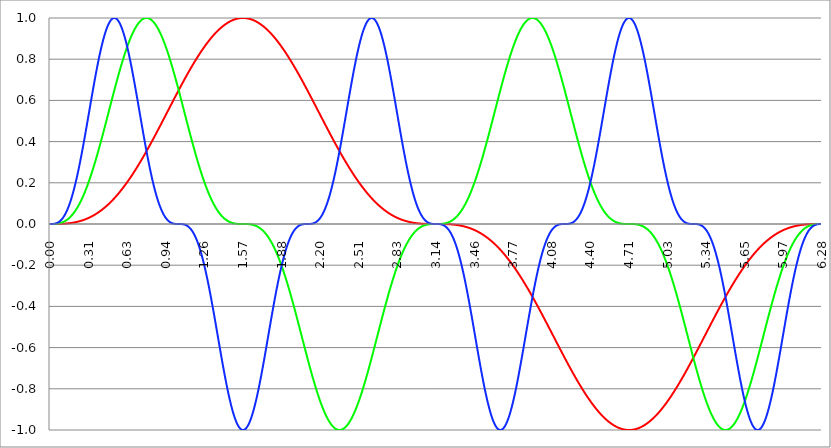
| Category | Series 1 | Series 0 | Series 2 |
|---|---|---|---|
| 0.0 | 0 | 0 | 0 |
| 0.00314159265358979 | 0 | 0 | 0 |
| 0.00628318530717958 | 0 | 0 | 0 |
| 0.00942477796076938 | 0 | 0 | 0 |
| 0.0125663706143592 | 0 | 0 | 0 |
| 0.015707963267949 | 0 | 0 | 0 |
| 0.0188495559215388 | 0 | 0 | 0 |
| 0.0219911485751285 | 0 | 0 | 0 |
| 0.0251327412287183 | 0 | 0 | 0 |
| 0.0282743338823081 | 0 | 0 | 0.001 |
| 0.0314159265358979 | 0 | 0 | 0.001 |
| 0.0345575191894877 | 0 | 0 | 0.001 |
| 0.0376991118430775 | 0 | 0 | 0.001 |
| 0.0408407044966673 | 0 | 0.001 | 0.002 |
| 0.0439822971502571 | 0 | 0.001 | 0.002 |
| 0.0471238898038469 | 0 | 0.001 | 0.003 |
| 0.0502654824574367 | 0 | 0.001 | 0.003 |
| 0.0534070751110265 | 0 | 0.001 | 0.004 |
| 0.0565486677646163 | 0 | 0.001 | 0.005 |
| 0.059690260418206 | 0 | 0.002 | 0.006 |
| 0.0628318530717958 | 0 | 0.002 | 0.007 |
| 0.0659734457253856 | 0 | 0.002 | 0.008 |
| 0.0691150383789754 | 0 | 0.003 | 0.009 |
| 0.0722566310325652 | 0 | 0.003 | 0.01 |
| 0.075398223686155 | 0 | 0.003 | 0.011 |
| 0.0785398163397448 | 0 | 0.004 | 0.013 |
| 0.0816814089933346 | 0.001 | 0.004 | 0.014 |
| 0.0848230016469244 | 0.001 | 0.005 | 0.016 |
| 0.0879645943005142 | 0.001 | 0.005 | 0.018 |
| 0.091106186954104 | 0.001 | 0.006 | 0.02 |
| 0.0942477796076937 | 0.001 | 0.007 | 0.022 |
| 0.0973893722612835 | 0.001 | 0.007 | 0.024 |
| 0.100530964914873 | 0.001 | 0.008 | 0.026 |
| 0.103672557568463 | 0.001 | 0.009 | 0.029 |
| 0.106814150222053 | 0.001 | 0.01 | 0.031 |
| 0.109955742875643 | 0.001 | 0.01 | 0.034 |
| 0.113097335529233 | 0.001 | 0.011 | 0.037 |
| 0.116238928182822 | 0.002 | 0.012 | 0.04 |
| 0.119380520836412 | 0.002 | 0.013 | 0.043 |
| 0.122522113490002 | 0.002 | 0.014 | 0.046 |
| 0.125663706143592 | 0.002 | 0.015 | 0.05 |
| 0.128805298797181 | 0.002 | 0.017 | 0.054 |
| 0.131946891450771 | 0.002 | 0.018 | 0.057 |
| 0.135088484104361 | 0.002 | 0.019 | 0.061 |
| 0.138230076757951 | 0.003 | 0.02 | 0.065 |
| 0.141371669411541 | 0.003 | 0.022 | 0.07 |
| 0.14451326206513 | 0.003 | 0.023 | 0.074 |
| 0.14765485471872 | 0.003 | 0.025 | 0.079 |
| 0.15079644737231 | 0.003 | 0.026 | 0.084 |
| 0.1539380400259 | 0.004 | 0.028 | 0.088 |
| 0.15707963267949 | 0.004 | 0.03 | 0.094 |
| 0.160221225333079 | 0.004 | 0.031 | 0.099 |
| 0.163362817986669 | 0.004 | 0.033 | 0.104 |
| 0.166504410640259 | 0.005 | 0.035 | 0.11 |
| 0.169646003293849 | 0.005 | 0.037 | 0.116 |
| 0.172787595947439 | 0.005 | 0.039 | 0.122 |
| 0.175929188601028 | 0.005 | 0.041 | 0.128 |
| 0.179070781254618 | 0.006 | 0.043 | 0.134 |
| 0.182212373908208 | 0.006 | 0.045 | 0.14 |
| 0.185353966561798 | 0.006 | 0.048 | 0.147 |
| 0.188495559215388 | 0.007 | 0.05 | 0.154 |
| 0.191637151868977 | 0.007 | 0.052 | 0.161 |
| 0.194778744522567 | 0.007 | 0.055 | 0.168 |
| 0.197920337176157 | 0.008 | 0.057 | 0.175 |
| 0.201061929829747 | 0.008 | 0.06 | 0.183 |
| 0.204203522483336 | 0.008 | 0.063 | 0.19 |
| 0.207345115136926 | 0.009 | 0.065 | 0.198 |
| 0.210486707790516 | 0.009 | 0.068 | 0.206 |
| 0.213628300444106 | 0.01 | 0.071 | 0.214 |
| 0.216769893097696 | 0.01 | 0.074 | 0.222 |
| 0.219911485751285 | 0.01 | 0.077 | 0.23 |
| 0.223053078404875 | 0.011 | 0.08 | 0.239 |
| 0.226194671058465 | 0.011 | 0.084 | 0.247 |
| 0.229336263712055 | 0.012 | 0.087 | 0.256 |
| 0.232477856365645 | 0.012 | 0.09 | 0.265 |
| 0.235619449019234 | 0.013 | 0.094 | 0.274 |
| 0.238761041672824 | 0.013 | 0.097 | 0.283 |
| 0.241902634326414 | 0.014 | 0.101 | 0.292 |
| 0.245044226980004 | 0.014 | 0.104 | 0.302 |
| 0.248185819633594 | 0.015 | 0.108 | 0.311 |
| 0.251327412287183 | 0.015 | 0.112 | 0.321 |
| 0.254469004940773 | 0.016 | 0.116 | 0.33 |
| 0.257610597594363 | 0.017 | 0.12 | 0.34 |
| 0.260752190247953 | 0.017 | 0.124 | 0.35 |
| 0.263893782901543 | 0.018 | 0.128 | 0.36 |
| 0.267035375555132 | 0.018 | 0.132 | 0.37 |
| 0.270176968208722 | 0.019 | 0.136 | 0.381 |
| 0.273318560862312 | 0.02 | 0.14 | 0.391 |
| 0.276460153515902 | 0.02 | 0.145 | 0.401 |
| 0.279601746169492 | 0.021 | 0.149 | 0.412 |
| 0.282743338823082 | 0.022 | 0.154 | 0.422 |
| 0.285884931476671 | 0.022 | 0.158 | 0.433 |
| 0.289026524130261 | 0.023 | 0.163 | 0.443 |
| 0.292168116783851 | 0.024 | 0.168 | 0.454 |
| 0.295309709437441 | 0.025 | 0.173 | 0.465 |
| 0.298451302091031 | 0.025 | 0.178 | 0.475 |
| 0.30159289474462 | 0.026 | 0.183 | 0.486 |
| 0.30473448739821 | 0.027 | 0.188 | 0.497 |
| 0.3078760800518 | 0.028 | 0.193 | 0.508 |
| 0.31101767270539 | 0.029 | 0.198 | 0.519 |
| 0.31415926535898 | 0.03 | 0.203 | 0.53 |
| 0.31730085801257 | 0.03 | 0.208 | 0.54 |
| 0.320442450666159 | 0.031 | 0.214 | 0.551 |
| 0.323584043319749 | 0.032 | 0.219 | 0.562 |
| 0.326725635973339 | 0.033 | 0.225 | 0.573 |
| 0.329867228626929 | 0.034 | 0.23 | 0.584 |
| 0.333008821280519 | 0.035 | 0.236 | 0.595 |
| 0.336150413934108 | 0.036 | 0.242 | 0.606 |
| 0.339292006587698 | 0.037 | 0.247 | 0.616 |
| 0.342433599241288 | 0.038 | 0.253 | 0.627 |
| 0.345575191894878 | 0.039 | 0.259 | 0.638 |
| 0.348716784548468 | 0.04 | 0.265 | 0.648 |
| 0.351858377202058 | 0.041 | 0.271 | 0.659 |
| 0.354999969855647 | 0.042 | 0.277 | 0.669 |
| 0.358141562509237 | 0.043 | 0.283 | 0.68 |
| 0.361283155162827 | 0.044 | 0.289 | 0.69 |
| 0.364424747816417 | 0.045 | 0.295 | 0.701 |
| 0.367566340470007 | 0.046 | 0.302 | 0.711 |
| 0.370707933123597 | 0.048 | 0.308 | 0.721 |
| 0.373849525777186 | 0.049 | 0.314 | 0.731 |
| 0.376991118430776 | 0.05 | 0.321 | 0.741 |
| 0.380132711084366 | 0.051 | 0.327 | 0.751 |
| 0.383274303737956 | 0.052 | 0.334 | 0.76 |
| 0.386415896391546 | 0.054 | 0.34 | 0.77 |
| 0.389557489045135 | 0.055 | 0.347 | 0.779 |
| 0.392699081698725 | 0.056 | 0.354 | 0.789 |
| 0.395840674352315 | 0.057 | 0.36 | 0.798 |
| 0.398982267005905 | 0.059 | 0.367 | 0.807 |
| 0.402123859659495 | 0.06 | 0.374 | 0.816 |
| 0.405265452313085 | 0.061 | 0.381 | 0.824 |
| 0.408407044966674 | 0.063 | 0.387 | 0.833 |
| 0.411548637620264 | 0.064 | 0.394 | 0.841 |
| 0.414690230273854 | 0.065 | 0.401 | 0.85 |
| 0.417831822927444 | 0.067 | 0.408 | 0.858 |
| 0.420973415581034 | 0.068 | 0.415 | 0.865 |
| 0.424115008234623 | 0.07 | 0.422 | 0.873 |
| 0.427256600888213 | 0.071 | 0.429 | 0.881 |
| 0.430398193541803 | 0.073 | 0.436 | 0.888 |
| 0.433539786195393 | 0.074 | 0.443 | 0.895 |
| 0.436681378848983 | 0.076 | 0.45 | 0.902 |
| 0.439822971502573 | 0.077 | 0.457 | 0.909 |
| 0.442964564156162 | 0.079 | 0.465 | 0.915 |
| 0.446106156809752 | 0.08 | 0.472 | 0.921 |
| 0.449247749463342 | 0.082 | 0.479 | 0.928 |
| 0.452389342116932 | 0.084 | 0.486 | 0.933 |
| 0.455530934770522 | 0.085 | 0.493 | 0.939 |
| 0.458672527424111 | 0.087 | 0.501 | 0.944 |
| 0.461814120077701 | 0.088 | 0.508 | 0.949 |
| 0.464955712731291 | 0.09 | 0.515 | 0.954 |
| 0.468097305384881 | 0.092 | 0.522 | 0.959 |
| 0.471238898038471 | 0.094 | 0.53 | 0.964 |
| 0.474380490692061 | 0.095 | 0.537 | 0.968 |
| 0.47752208334565 | 0.097 | 0.544 | 0.972 |
| 0.48066367599924 | 0.099 | 0.551 | 0.975 |
| 0.48380526865283 | 0.101 | 0.559 | 0.979 |
| 0.48694686130642 | 0.102 | 0.566 | 0.982 |
| 0.49008845396001 | 0.104 | 0.573 | 0.985 |
| 0.493230046613599 | 0.106 | 0.58 | 0.988 |
| 0.496371639267189 | 0.108 | 0.587 | 0.99 |
| 0.499513231920779 | 0.11 | 0.595 | 0.992 |
| 0.502654824574369 | 0.112 | 0.602 | 0.994 |
| 0.505796417227959 | 0.114 | 0.609 | 0.996 |
| 0.508938009881549 | 0.116 | 0.616 | 0.997 |
| 0.512079602535138 | 0.118 | 0.623 | 0.998 |
| 0.515221195188728 | 0.12 | 0.631 | 0.999 |
| 0.518362787842318 | 0.122 | 0.638 | 1 |
| 0.521504380495908 | 0.124 | 0.645 | 1 |
| 0.524645973149498 | 0.126 | 0.652 | 1 |
| 0.527787565803087 | 0.128 | 0.659 | 1 |
| 0.530929158456677 | 0.13 | 0.666 | 0.999 |
| 0.534070751110267 | 0.132 | 0.673 | 0.999 |
| 0.537212343763857 | 0.134 | 0.68 | 0.998 |
| 0.540353936417447 | 0.136 | 0.687 | 0.996 |
| 0.543495529071037 | 0.138 | 0.694 | 0.995 |
| 0.546637121724626 | 0.14 | 0.701 | 0.993 |
| 0.549778714378216 | 0.143 | 0.707 | 0.991 |
| 0.552920307031806 | 0.145 | 0.714 | 0.988 |
| 0.556061899685396 | 0.147 | 0.721 | 0.986 |
| 0.559203492338986 | 0.149 | 0.728 | 0.983 |
| 0.562345084992576 | 0.152 | 0.734 | 0.98 |
| 0.565486677646165 | 0.154 | 0.741 | 0.977 |
| 0.568628270299755 | 0.156 | 0.747 | 0.973 |
| 0.571769862953345 | 0.158 | 0.754 | 0.969 |
| 0.574911455606935 | 0.161 | 0.76 | 0.965 |
| 0.578053048260525 | 0.163 | 0.767 | 0.961 |
| 0.581194640914114 | 0.165 | 0.773 | 0.956 |
| 0.584336233567704 | 0.168 | 0.779 | 0.951 |
| 0.587477826221294 | 0.17 | 0.785 | 0.946 |
| 0.590619418874884 | 0.173 | 0.792 | 0.941 |
| 0.593761011528474 | 0.175 | 0.798 | 0.935 |
| 0.596902604182064 | 0.178 | 0.804 | 0.929 |
| 0.600044196835653 | 0.18 | 0.81 | 0.923 |
| 0.603185789489243 | 0.183 | 0.816 | 0.917 |
| 0.606327382142833 | 0.185 | 0.821 | 0.911 |
| 0.609468974796423 | 0.188 | 0.827 | 0.904 |
| 0.612610567450013 | 0.19 | 0.833 | 0.897 |
| 0.615752160103602 | 0.193 | 0.839 | 0.89 |
| 0.618893752757192 | 0.195 | 0.844 | 0.883 |
| 0.622035345410782 | 0.198 | 0.85 | 0.876 |
| 0.625176938064372 | 0.2 | 0.855 | 0.868 |
| 0.628318530717962 | 0.203 | 0.86 | 0.86 |
| 0.631460123371551 | 0.206 | 0.865 | 0.852 |
| 0.634601716025141 | 0.208 | 0.871 | 0.844 |
| 0.637743308678731 | 0.211 | 0.876 | 0.836 |
| 0.640884901332321 | 0.214 | 0.881 | 0.827 |
| 0.644026493985911 | 0.216 | 0.886 | 0.819 |
| 0.647168086639501 | 0.219 | 0.89 | 0.81 |
| 0.65030967929309 | 0.222 | 0.895 | 0.801 |
| 0.65345127194668 | 0.225 | 0.9 | 0.792 |
| 0.65659286460027 | 0.227 | 0.904 | 0.782 |
| 0.65973445725386 | 0.23 | 0.909 | 0.773 |
| 0.66287604990745 | 0.233 | 0.913 | 0.763 |
| 0.666017642561039 | 0.236 | 0.917 | 0.754 |
| 0.669159235214629 | 0.239 | 0.921 | 0.744 |
| 0.672300827868219 | 0.242 | 0.926 | 0.734 |
| 0.675442420521809 | 0.244 | 0.929 | 0.724 |
| 0.678584013175399 | 0.247 | 0.933 | 0.714 |
| 0.681725605828989 | 0.25 | 0.937 | 0.704 |
| 0.684867198482578 | 0.253 | 0.941 | 0.694 |
| 0.688008791136168 | 0.256 | 0.944 | 0.683 |
| 0.691150383789758 | 0.259 | 0.948 | 0.673 |
| 0.694291976443348 | 0.262 | 0.951 | 0.662 |
| 0.697433569096938 | 0.265 | 0.954 | 0.652 |
| 0.700575161750528 | 0.268 | 0.958 | 0.641 |
| 0.703716754404117 | 0.271 | 0.961 | 0.631 |
| 0.706858347057707 | 0.274 | 0.964 | 0.62 |
| 0.709999939711297 | 0.277 | 0.966 | 0.609 |
| 0.713141532364887 | 0.28 | 0.969 | 0.598 |
| 0.716283125018477 | 0.283 | 0.972 | 0.587 |
| 0.719424717672066 | 0.286 | 0.974 | 0.577 |
| 0.722566310325656 | 0.289 | 0.977 | 0.566 |
| 0.725707902979246 | 0.292 | 0.979 | 0.555 |
| 0.728849495632836 | 0.295 | 0.981 | 0.544 |
| 0.731991088286426 | 0.299 | 0.983 | 0.533 |
| 0.735132680940016 | 0.302 | 0.985 | 0.522 |
| 0.738274273593605 | 0.305 | 0.987 | 0.511 |
| 0.741415866247195 | 0.308 | 0.988 | 0.501 |
| 0.744557458900785 | 0.311 | 0.99 | 0.49 |
| 0.747699051554375 | 0.314 | 0.992 | 0.479 |
| 0.750840644207965 | 0.318 | 0.993 | 0.468 |
| 0.753982236861554 | 0.321 | 0.994 | 0.457 |
| 0.757123829515144 | 0.324 | 0.995 | 0.447 |
| 0.760265422168734 | 0.327 | 0.996 | 0.436 |
| 0.763407014822324 | 0.33 | 0.997 | 0.426 |
| 0.766548607475914 | 0.334 | 0.998 | 0.415 |
| 0.769690200129504 | 0.337 | 0.999 | 0.405 |
| 0.772831792783093 | 0.34 | 0.999 | 0.394 |
| 0.775973385436683 | 0.344 | 0.999 | 0.384 |
| 0.779114978090273 | 0.347 | 1 | 0.374 |
| 0.782256570743863 | 0.35 | 1 | 0.364 |
| 0.785398163397453 | 0.354 | 1 | 0.354 |
| 0.788539756051042 | 0.357 | 1 | 0.344 |
| 0.791681348704632 | 0.36 | 1 | 0.334 |
| 0.794822941358222 | 0.364 | 0.999 | 0.324 |
| 0.797964534011812 | 0.367 | 0.999 | 0.314 |
| 0.801106126665402 | 0.37 | 0.999 | 0.305 |
| 0.804247719318992 | 0.374 | 0.998 | 0.295 |
| 0.807389311972581 | 0.377 | 0.997 | 0.286 |
| 0.810530904626171 | 0.381 | 0.996 | 0.277 |
| 0.813672497279761 | 0.384 | 0.995 | 0.268 |
| 0.816814089933351 | 0.387 | 0.994 | 0.259 |
| 0.819955682586941 | 0.391 | 0.993 | 0.25 |
| 0.823097275240531 | 0.394 | 0.992 | 0.242 |
| 0.82623886789412 | 0.398 | 0.99 | 0.233 |
| 0.82938046054771 | 0.401 | 0.988 | 0.225 |
| 0.8325220532013 | 0.405 | 0.987 | 0.216 |
| 0.83566364585489 | 0.408 | 0.985 | 0.208 |
| 0.83880523850848 | 0.412 | 0.983 | 0.2 |
| 0.841946831162069 | 0.415 | 0.981 | 0.193 |
| 0.845088423815659 | 0.419 | 0.979 | 0.185 |
| 0.848230016469249 | 0.422 | 0.977 | 0.178 |
| 0.851371609122839 | 0.426 | 0.974 | 0.17 |
| 0.854513201776429 | 0.429 | 0.972 | 0.163 |
| 0.857654794430019 | 0.433 | 0.969 | 0.156 |
| 0.860796387083608 | 0.436 | 0.966 | 0.149 |
| 0.863937979737198 | 0.44 | 0.964 | 0.143 |
| 0.867079572390788 | 0.443 | 0.961 | 0.136 |
| 0.870221165044378 | 0.447 | 0.958 | 0.13 |
| 0.873362757697968 | 0.45 | 0.954 | 0.124 |
| 0.876504350351557 | 0.454 | 0.951 | 0.118 |
| 0.879645943005147 | 0.457 | 0.948 | 0.112 |
| 0.882787535658737 | 0.461 | 0.944 | 0.106 |
| 0.885929128312327 | 0.465 | 0.941 | 0.101 |
| 0.889070720965917 | 0.468 | 0.937 | 0.095 |
| 0.892212313619507 | 0.472 | 0.933 | 0.09 |
| 0.895353906273096 | 0.475 | 0.929 | 0.085 |
| 0.898495498926686 | 0.479 | 0.926 | 0.08 |
| 0.901637091580276 | 0.483 | 0.921 | 0.076 |
| 0.904778684233866 | 0.486 | 0.917 | 0.071 |
| 0.907920276887456 | 0.49 | 0.913 | 0.067 |
| 0.911061869541045 | 0.493 | 0.909 | 0.063 |
| 0.914203462194635 | 0.497 | 0.904 | 0.059 |
| 0.917345054848225 | 0.501 | 0.9 | 0.055 |
| 0.920486647501815 | 0.504 | 0.895 | 0.051 |
| 0.923628240155405 | 0.508 | 0.89 | 0.048 |
| 0.926769832808995 | 0.511 | 0.886 | 0.044 |
| 0.929911425462584 | 0.515 | 0.881 | 0.041 |
| 0.933053018116174 | 0.519 | 0.876 | 0.038 |
| 0.936194610769764 | 0.522 | 0.871 | 0.035 |
| 0.939336203423354 | 0.526 | 0.865 | 0.032 |
| 0.942477796076944 | 0.53 | 0.86 | 0.03 |
| 0.945619388730533 | 0.533 | 0.855 | 0.027 |
| 0.948760981384123 | 0.537 | 0.85 | 0.025 |
| 0.951902574037713 | 0.54 | 0.844 | 0.022 |
| 0.955044166691303 | 0.544 | 0.839 | 0.02 |
| 0.958185759344893 | 0.548 | 0.833 | 0.018 |
| 0.961327351998483 | 0.551 | 0.827 | 0.017 |
| 0.964468944652072 | 0.555 | 0.821 | 0.015 |
| 0.967610537305662 | 0.559 | 0.816 | 0.013 |
| 0.970752129959252 | 0.562 | 0.81 | 0.012 |
| 0.973893722612842 | 0.566 | 0.804 | 0.01 |
| 0.977035315266432 | 0.569 | 0.798 | 0.009 |
| 0.980176907920022 | 0.573 | 0.792 | 0.008 |
| 0.983318500573611 | 0.577 | 0.785 | 0.007 |
| 0.986460093227201 | 0.58 | 0.779 | 0.006 |
| 0.989601685880791 | 0.584 | 0.773 | 0.005 |
| 0.992743278534381 | 0.587 | 0.767 | 0.004 |
| 0.995884871187971 | 0.591 | 0.76 | 0.004 |
| 0.99902646384156 | 0.595 | 0.754 | 0.003 |
| 1.00216805649515 | 0.598 | 0.747 | 0.002 |
| 1.00530964914874 | 0.602 | 0.741 | 0.002 |
| 1.00845124180233 | 0.606 | 0.734 | 0.002 |
| 1.01159283445592 | 0.609 | 0.728 | 0.001 |
| 1.01473442710951 | 0.613 | 0.721 | 0.001 |
| 1.017876019763099 | 0.616 | 0.714 | 0.001 |
| 1.021017612416689 | 0.62 | 0.707 | 0 |
| 1.02415920507028 | 0.623 | 0.701 | 0 |
| 1.027300797723869 | 0.627 | 0.694 | 0 |
| 1.030442390377459 | 0.631 | 0.687 | 0 |
| 1.033583983031048 | 0.634 | 0.68 | 0 |
| 1.036725575684638 | 0.638 | 0.673 | 0 |
| 1.039867168338228 | 0.641 | 0.666 | 0 |
| 1.043008760991818 | 0.645 | 0.659 | 0 |
| 1.046150353645408 | 0.648 | 0.652 | 0 |
| 1.049291946298998 | 0.652 | 0.645 | 0 |
| 1.052433538952587 | 0.655 | 0.638 | 0 |
| 1.055575131606177 | 0.659 | 0.631 | 0 |
| 1.058716724259767 | 0.662 | 0.623 | 0 |
| 1.061858316913357 | 0.666 | 0.616 | 0 |
| 1.064999909566947 | 0.669 | 0.609 | 0 |
| 1.068141502220536 | 0.673 | 0.602 | 0 |
| 1.071283094874126 | 0.676 | 0.595 | 0 |
| 1.074424687527716 | 0.68 | 0.587 | -0.001 |
| 1.077566280181306 | 0.683 | 0.58 | -0.001 |
| 1.080707872834896 | 0.687 | 0.573 | -0.001 |
| 1.083849465488486 | 0.69 | 0.566 | -0.001 |
| 1.086991058142075 | 0.694 | 0.559 | -0.002 |
| 1.090132650795665 | 0.697 | 0.551 | -0.002 |
| 1.093274243449255 | 0.701 | 0.544 | -0.003 |
| 1.096415836102845 | 0.704 | 0.537 | -0.003 |
| 1.099557428756435 | 0.707 | 0.53 | -0.004 |
| 1.102699021410025 | 0.711 | 0.522 | -0.005 |
| 1.105840614063614 | 0.714 | 0.515 | -0.005 |
| 1.108982206717204 | 0.718 | 0.508 | -0.006 |
| 1.112123799370794 | 0.721 | 0.501 | -0.007 |
| 1.115265392024384 | 0.724 | 0.493 | -0.008 |
| 1.118406984677974 | 0.728 | 0.486 | -0.01 |
| 1.121548577331563 | 0.731 | 0.479 | -0.011 |
| 1.124690169985153 | 0.734 | 0.472 | -0.012 |
| 1.127831762638743 | 0.738 | 0.465 | -0.014 |
| 1.130973355292333 | 0.741 | 0.457 | -0.015 |
| 1.134114947945923 | 0.744 | 0.45 | -0.017 |
| 1.137256540599513 | 0.747 | 0.443 | -0.019 |
| 1.140398133253102 | 0.751 | 0.436 | -0.021 |
| 1.143539725906692 | 0.754 | 0.429 | -0.023 |
| 1.146681318560282 | 0.757 | 0.422 | -0.025 |
| 1.149822911213872 | 0.76 | 0.415 | -0.028 |
| 1.152964503867462 | 0.763 | 0.408 | -0.03 |
| 1.156106096521051 | 0.767 | 0.401 | -0.033 |
| 1.159247689174641 | 0.77 | 0.394 | -0.036 |
| 1.162389281828231 | 0.773 | 0.387 | -0.039 |
| 1.165530874481821 | 0.776 | 0.381 | -0.042 |
| 1.168672467135411 | 0.779 | 0.374 | -0.045 |
| 1.171814059789001 | 0.782 | 0.367 | -0.049 |
| 1.17495565244259 | 0.785 | 0.36 | -0.052 |
| 1.17809724509618 | 0.789 | 0.354 | -0.056 |
| 1.18123883774977 | 0.792 | 0.347 | -0.06 |
| 1.18438043040336 | 0.795 | 0.34 | -0.064 |
| 1.18752202305695 | 0.798 | 0.334 | -0.068 |
| 1.190663615710539 | 0.801 | 0.327 | -0.073 |
| 1.193805208364129 | 0.804 | 0.321 | -0.077 |
| 1.19694680101772 | 0.807 | 0.314 | -0.082 |
| 1.200088393671309 | 0.81 | 0.308 | -0.087 |
| 1.203229986324899 | 0.813 | 0.302 | -0.092 |
| 1.206371578978489 | 0.816 | 0.295 | -0.097 |
| 1.209513171632078 | 0.819 | 0.289 | -0.102 |
| 1.212654764285668 | 0.821 | 0.283 | -0.108 |
| 1.215796356939258 | 0.824 | 0.277 | -0.114 |
| 1.218937949592848 | 0.827 | 0.271 | -0.12 |
| 1.222079542246438 | 0.83 | 0.265 | -0.126 |
| 1.225221134900027 | 0.833 | 0.259 | -0.132 |
| 1.228362727553617 | 0.836 | 0.253 | -0.138 |
| 1.231504320207207 | 0.839 | 0.247 | -0.145 |
| 1.234645912860797 | 0.841 | 0.242 | -0.152 |
| 1.237787505514387 | 0.844 | 0.236 | -0.158 |
| 1.240929098167977 | 0.847 | 0.23 | -0.165 |
| 1.244070690821566 | 0.85 | 0.225 | -0.173 |
| 1.247212283475156 | 0.852 | 0.219 | -0.18 |
| 1.250353876128746 | 0.855 | 0.214 | -0.188 |
| 1.253495468782336 | 0.858 | 0.208 | -0.195 |
| 1.256637061435926 | 0.86 | 0.203 | -0.203 |
| 1.259778654089515 | 0.863 | 0.198 | -0.211 |
| 1.262920246743105 | 0.865 | 0.193 | -0.219 |
| 1.266061839396695 | 0.868 | 0.188 | -0.227 |
| 1.269203432050285 | 0.871 | 0.183 | -0.236 |
| 1.272345024703875 | 0.873 | 0.178 | -0.244 |
| 1.275486617357465 | 0.876 | 0.173 | -0.253 |
| 1.278628210011054 | 0.878 | 0.168 | -0.262 |
| 1.281769802664644 | 0.881 | 0.163 | -0.271 |
| 1.284911395318234 | 0.883 | 0.158 | -0.28 |
| 1.288052987971824 | 0.886 | 0.154 | -0.289 |
| 1.291194580625414 | 0.888 | 0.149 | -0.299 |
| 1.294336173279003 | 0.89 | 0.145 | -0.308 |
| 1.297477765932593 | 0.893 | 0.14 | -0.318 |
| 1.300619358586183 | 0.895 | 0.136 | -0.327 |
| 1.303760951239773 | 0.897 | 0.132 | -0.337 |
| 1.306902543893363 | 0.9 | 0.128 | -0.347 |
| 1.310044136546953 | 0.902 | 0.124 | -0.357 |
| 1.313185729200542 | 0.904 | 0.12 | -0.367 |
| 1.316327321854132 | 0.906 | 0.116 | -0.377 |
| 1.319468914507722 | 0.909 | 0.112 | -0.387 |
| 1.322610507161312 | 0.911 | 0.108 | -0.398 |
| 1.325752099814902 | 0.913 | 0.104 | -0.408 |
| 1.328893692468491 | 0.915 | 0.101 | -0.419 |
| 1.332035285122081 | 0.917 | 0.097 | -0.429 |
| 1.335176877775671 | 0.919 | 0.094 | -0.44 |
| 1.338318470429261 | 0.921 | 0.09 | -0.45 |
| 1.341460063082851 | 0.923 | 0.087 | -0.461 |
| 1.344601655736441 | 0.926 | 0.084 | -0.472 |
| 1.34774324839003 | 0.928 | 0.08 | -0.483 |
| 1.35088484104362 | 0.929 | 0.077 | -0.493 |
| 1.35402643369721 | 0.931 | 0.074 | -0.504 |
| 1.3571680263508 | 0.933 | 0.071 | -0.515 |
| 1.36030961900439 | 0.935 | 0.068 | -0.526 |
| 1.363451211657979 | 0.937 | 0.065 | -0.537 |
| 1.36659280431157 | 0.939 | 0.063 | -0.548 |
| 1.369734396965159 | 0.941 | 0.06 | -0.559 |
| 1.372875989618749 | 0.943 | 0.057 | -0.569 |
| 1.376017582272339 | 0.944 | 0.055 | -0.58 |
| 1.379159174925929 | 0.946 | 0.052 | -0.591 |
| 1.382300767579518 | 0.948 | 0.05 | -0.602 |
| 1.385442360233108 | 0.949 | 0.048 | -0.613 |
| 1.388583952886698 | 0.951 | 0.045 | -0.623 |
| 1.391725545540288 | 0.953 | 0.043 | -0.634 |
| 1.394867138193878 | 0.954 | 0.041 | -0.645 |
| 1.398008730847468 | 0.956 | 0.039 | -0.655 |
| 1.401150323501057 | 0.958 | 0.037 | -0.666 |
| 1.404291916154647 | 0.959 | 0.035 | -0.676 |
| 1.407433508808237 | 0.961 | 0.033 | -0.687 |
| 1.410575101461827 | 0.962 | 0.031 | -0.697 |
| 1.413716694115417 | 0.964 | 0.03 | -0.707 |
| 1.416858286769006 | 0.965 | 0.028 | -0.718 |
| 1.419999879422596 | 0.966 | 0.026 | -0.728 |
| 1.423141472076186 | 0.968 | 0.025 | -0.738 |
| 1.426283064729776 | 0.969 | 0.023 | -0.747 |
| 1.429424657383366 | 0.97 | 0.022 | -0.757 |
| 1.432566250036956 | 0.972 | 0.02 | -0.767 |
| 1.435707842690545 | 0.973 | 0.019 | -0.776 |
| 1.438849435344135 | 0.974 | 0.018 | -0.785 |
| 1.441991027997725 | 0.975 | 0.017 | -0.795 |
| 1.445132620651315 | 0.977 | 0.015 | -0.804 |
| 1.448274213304905 | 0.978 | 0.014 | -0.813 |
| 1.451415805958494 | 0.979 | 0.013 | -0.821 |
| 1.454557398612084 | 0.98 | 0.012 | -0.83 |
| 1.457698991265674 | 0.981 | 0.011 | -0.839 |
| 1.460840583919264 | 0.982 | 0.01 | -0.847 |
| 1.463982176572854 | 0.983 | 0.01 | -0.855 |
| 1.467123769226444 | 0.984 | 0.009 | -0.863 |
| 1.470265361880033 | 0.985 | 0.008 | -0.871 |
| 1.473406954533623 | 0.986 | 0.007 | -0.878 |
| 1.476548547187213 | 0.987 | 0.007 | -0.886 |
| 1.479690139840803 | 0.988 | 0.006 | -0.893 |
| 1.482831732494393 | 0.988 | 0.005 | -0.9 |
| 1.485973325147982 | 0.989 | 0.005 | -0.906 |
| 1.489114917801572 | 0.99 | 0.004 | -0.913 |
| 1.492256510455162 | 0.991 | 0.004 | -0.919 |
| 1.495398103108752 | 0.992 | 0.003 | -0.926 |
| 1.498539695762342 | 0.992 | 0.003 | -0.931 |
| 1.501681288415932 | 0.993 | 0.003 | -0.937 |
| 1.504822881069521 | 0.993 | 0.002 | -0.943 |
| 1.507964473723111 | 0.994 | 0.002 | -0.948 |
| 1.511106066376701 | 0.995 | 0.002 | -0.953 |
| 1.514247659030291 | 0.995 | 0.001 | -0.958 |
| 1.517389251683881 | 0.996 | 0.001 | -0.962 |
| 1.520530844337471 | 0.996 | 0.001 | -0.966 |
| 1.52367243699106 | 0.997 | 0.001 | -0.97 |
| 1.52681402964465 | 0.997 | 0.001 | -0.974 |
| 1.52995562229824 | 0.998 | 0.001 | -0.978 |
| 1.53309721495183 | 0.998 | 0 | -0.981 |
| 1.53623880760542 | 0.998 | 0 | -0.984 |
| 1.539380400259009 | 0.999 | 0 | -0.987 |
| 1.542521992912599 | 0.999 | 0 | -0.989 |
| 1.545663585566189 | 0.999 | 0 | -0.992 |
| 1.548805178219779 | 0.999 | 0 | -0.993 |
| 1.551946770873369 | 0.999 | 0 | -0.995 |
| 1.555088363526959 | 1 | 0 | -0.997 |
| 1.558229956180548 | 1 | 0 | -0.998 |
| 1.561371548834138 | 1 | 0 | -0.999 |
| 1.564513141487728 | 1 | 0 | -0.999 |
| 1.567654734141318 | 1 | 0 | -1 |
| 1.570796326794908 | 1 | 0 | -1 |
| 1.573937919448497 | 1 | 0 | -1 |
| 1.577079512102087 | 1 | 0 | -0.999 |
| 1.580221104755677 | 1 | 0 | -0.999 |
| 1.583362697409267 | 1 | 0 | -0.998 |
| 1.586504290062857 | 1 | 0 | -0.997 |
| 1.589645882716447 | 0.999 | 0 | -0.995 |
| 1.592787475370036 | 0.999 | 0 | -0.993 |
| 1.595929068023626 | 0.999 | 0 | -0.992 |
| 1.599070660677216 | 0.999 | 0 | -0.989 |
| 1.602212253330806 | 0.999 | 0 | -0.987 |
| 1.605353845984396 | 0.998 | 0 | -0.984 |
| 1.608495438637985 | 0.998 | 0 | -0.981 |
| 1.611637031291575 | 0.998 | -0.001 | -0.978 |
| 1.614778623945165 | 0.997 | -0.001 | -0.974 |
| 1.617920216598755 | 0.997 | -0.001 | -0.97 |
| 1.621061809252345 | 0.996 | -0.001 | -0.966 |
| 1.624203401905935 | 0.996 | -0.001 | -0.962 |
| 1.627344994559524 | 0.995 | -0.001 | -0.958 |
| 1.630486587213114 | 0.995 | -0.002 | -0.953 |
| 1.633628179866704 | 0.994 | -0.002 | -0.948 |
| 1.636769772520294 | 0.993 | -0.002 | -0.943 |
| 1.639911365173884 | 0.993 | -0.003 | -0.937 |
| 1.643052957827473 | 0.992 | -0.003 | -0.931 |
| 1.646194550481063 | 0.992 | -0.003 | -0.926 |
| 1.649336143134653 | 0.991 | -0.004 | -0.919 |
| 1.652477735788243 | 0.99 | -0.004 | -0.913 |
| 1.655619328441833 | 0.989 | -0.005 | -0.906 |
| 1.658760921095423 | 0.988 | -0.005 | -0.9 |
| 1.661902513749012 | 0.988 | -0.006 | -0.893 |
| 1.665044106402602 | 0.987 | -0.007 | -0.886 |
| 1.668185699056192 | 0.986 | -0.007 | -0.878 |
| 1.671327291709782 | 0.985 | -0.008 | -0.871 |
| 1.674468884363372 | 0.984 | -0.009 | -0.863 |
| 1.677610477016961 | 0.983 | -0.01 | -0.855 |
| 1.680752069670551 | 0.982 | -0.01 | -0.847 |
| 1.683893662324141 | 0.981 | -0.011 | -0.839 |
| 1.687035254977731 | 0.98 | -0.012 | -0.83 |
| 1.690176847631321 | 0.979 | -0.013 | -0.821 |
| 1.693318440284911 | 0.978 | -0.014 | -0.813 |
| 1.6964600329385 | 0.977 | -0.015 | -0.804 |
| 1.69960162559209 | 0.975 | -0.017 | -0.795 |
| 1.70274321824568 | 0.974 | -0.018 | -0.785 |
| 1.70588481089927 | 0.973 | -0.019 | -0.776 |
| 1.70902640355286 | 0.972 | -0.02 | -0.767 |
| 1.712167996206449 | 0.97 | -0.022 | -0.757 |
| 1.715309588860039 | 0.969 | -0.023 | -0.747 |
| 1.71845118151363 | 0.968 | -0.025 | -0.738 |
| 1.721592774167219 | 0.966 | -0.026 | -0.728 |
| 1.724734366820809 | 0.965 | -0.028 | -0.718 |
| 1.727875959474399 | 0.964 | -0.03 | -0.707 |
| 1.731017552127988 | 0.962 | -0.031 | -0.697 |
| 1.734159144781578 | 0.961 | -0.033 | -0.687 |
| 1.737300737435168 | 0.959 | -0.035 | -0.676 |
| 1.740442330088758 | 0.958 | -0.037 | -0.666 |
| 1.743583922742348 | 0.956 | -0.039 | -0.655 |
| 1.746725515395937 | 0.954 | -0.041 | -0.645 |
| 1.749867108049527 | 0.953 | -0.043 | -0.634 |
| 1.753008700703117 | 0.951 | -0.045 | -0.623 |
| 1.756150293356707 | 0.949 | -0.048 | -0.613 |
| 1.759291886010297 | 0.948 | -0.05 | -0.602 |
| 1.762433478663887 | 0.946 | -0.052 | -0.591 |
| 1.765575071317476 | 0.944 | -0.055 | -0.58 |
| 1.768716663971066 | 0.943 | -0.057 | -0.569 |
| 1.771858256624656 | 0.941 | -0.06 | -0.559 |
| 1.774999849278246 | 0.939 | -0.063 | -0.548 |
| 1.778141441931836 | 0.937 | -0.065 | -0.537 |
| 1.781283034585426 | 0.935 | -0.068 | -0.526 |
| 1.784424627239015 | 0.933 | -0.071 | -0.515 |
| 1.787566219892605 | 0.931 | -0.074 | -0.504 |
| 1.790707812546195 | 0.929 | -0.077 | -0.493 |
| 1.793849405199785 | 0.928 | -0.08 | -0.483 |
| 1.796990997853375 | 0.926 | -0.084 | -0.472 |
| 1.800132590506964 | 0.923 | -0.087 | -0.461 |
| 1.803274183160554 | 0.921 | -0.09 | -0.45 |
| 1.806415775814144 | 0.919 | -0.094 | -0.44 |
| 1.809557368467734 | 0.917 | -0.097 | -0.429 |
| 1.812698961121324 | 0.915 | -0.101 | -0.419 |
| 1.815840553774914 | 0.913 | -0.104 | -0.408 |
| 1.818982146428503 | 0.911 | -0.108 | -0.398 |
| 1.822123739082093 | 0.909 | -0.112 | -0.387 |
| 1.825265331735683 | 0.906 | -0.116 | -0.377 |
| 1.828406924389273 | 0.904 | -0.12 | -0.367 |
| 1.831548517042863 | 0.902 | -0.124 | -0.357 |
| 1.834690109696452 | 0.9 | -0.128 | -0.347 |
| 1.837831702350042 | 0.897 | -0.132 | -0.337 |
| 1.840973295003632 | 0.895 | -0.136 | -0.327 |
| 1.844114887657222 | 0.893 | -0.14 | -0.318 |
| 1.847256480310812 | 0.89 | -0.145 | -0.308 |
| 1.850398072964402 | 0.888 | -0.149 | -0.299 |
| 1.853539665617991 | 0.886 | -0.154 | -0.289 |
| 1.856681258271581 | 0.883 | -0.158 | -0.28 |
| 1.859822850925171 | 0.881 | -0.163 | -0.271 |
| 1.862964443578761 | 0.878 | -0.168 | -0.262 |
| 1.866106036232351 | 0.876 | -0.173 | -0.253 |
| 1.86924762888594 | 0.873 | -0.178 | -0.244 |
| 1.87238922153953 | 0.871 | -0.183 | -0.236 |
| 1.87553081419312 | 0.868 | -0.188 | -0.227 |
| 1.87867240684671 | 0.865 | -0.193 | -0.219 |
| 1.8818139995003 | 0.863 | -0.198 | -0.211 |
| 1.88495559215389 | 0.86 | -0.203 | -0.203 |
| 1.888097184807479 | 0.858 | -0.208 | -0.195 |
| 1.891238777461069 | 0.855 | -0.214 | -0.188 |
| 1.89438037011466 | 0.852 | -0.219 | -0.18 |
| 1.897521962768249 | 0.85 | -0.225 | -0.173 |
| 1.900663555421839 | 0.847 | -0.23 | -0.165 |
| 1.903805148075429 | 0.844 | -0.236 | -0.158 |
| 1.906946740729018 | 0.841 | -0.242 | -0.152 |
| 1.910088333382608 | 0.839 | -0.247 | -0.145 |
| 1.913229926036198 | 0.836 | -0.253 | -0.138 |
| 1.916371518689788 | 0.833 | -0.259 | -0.132 |
| 1.919513111343378 | 0.83 | -0.265 | -0.126 |
| 1.922654703996967 | 0.827 | -0.271 | -0.12 |
| 1.925796296650557 | 0.824 | -0.277 | -0.114 |
| 1.928937889304147 | 0.821 | -0.283 | -0.108 |
| 1.932079481957737 | 0.819 | -0.289 | -0.102 |
| 1.935221074611327 | 0.816 | -0.295 | -0.097 |
| 1.938362667264917 | 0.813 | -0.302 | -0.092 |
| 1.941504259918506 | 0.81 | -0.308 | -0.087 |
| 1.944645852572096 | 0.807 | -0.314 | -0.082 |
| 1.947787445225686 | 0.804 | -0.321 | -0.077 |
| 1.950929037879276 | 0.801 | -0.327 | -0.073 |
| 1.954070630532866 | 0.798 | -0.334 | -0.068 |
| 1.957212223186455 | 0.795 | -0.34 | -0.064 |
| 1.960353815840045 | 0.792 | -0.347 | -0.06 |
| 1.963495408493635 | 0.789 | -0.354 | -0.056 |
| 1.966637001147225 | 0.785 | -0.36 | -0.052 |
| 1.969778593800815 | 0.782 | -0.367 | -0.049 |
| 1.972920186454405 | 0.779 | -0.374 | -0.045 |
| 1.976061779107994 | 0.776 | -0.381 | -0.042 |
| 1.979203371761584 | 0.773 | -0.387 | -0.039 |
| 1.982344964415174 | 0.77 | -0.394 | -0.036 |
| 1.985486557068764 | 0.767 | -0.401 | -0.033 |
| 1.988628149722354 | 0.763 | -0.408 | -0.03 |
| 1.991769742375943 | 0.76 | -0.415 | -0.028 |
| 1.994911335029533 | 0.757 | -0.422 | -0.025 |
| 1.998052927683123 | 0.754 | -0.429 | -0.023 |
| 2.001194520336712 | 0.751 | -0.436 | -0.021 |
| 2.004336112990302 | 0.747 | -0.443 | -0.019 |
| 2.007477705643892 | 0.744 | -0.45 | -0.017 |
| 2.010619298297482 | 0.741 | -0.457 | -0.015 |
| 2.013760890951071 | 0.738 | -0.465 | -0.014 |
| 2.016902483604661 | 0.734 | -0.472 | -0.012 |
| 2.02004407625825 | 0.731 | -0.479 | -0.011 |
| 2.02318566891184 | 0.728 | -0.486 | -0.01 |
| 2.02632726156543 | 0.724 | -0.493 | -0.008 |
| 2.029468854219019 | 0.721 | -0.501 | -0.007 |
| 2.032610446872609 | 0.718 | -0.508 | -0.006 |
| 2.035752039526198 | 0.714 | -0.515 | -0.005 |
| 2.038893632179788 | 0.711 | -0.522 | -0.005 |
| 2.042035224833378 | 0.707 | -0.53 | -0.004 |
| 2.045176817486967 | 0.704 | -0.537 | -0.003 |
| 2.048318410140557 | 0.701 | -0.544 | -0.003 |
| 2.051460002794146 | 0.697 | -0.551 | -0.002 |
| 2.054601595447736 | 0.694 | -0.559 | -0.002 |
| 2.057743188101325 | 0.69 | -0.566 | -0.001 |
| 2.060884780754915 | 0.687 | -0.573 | -0.001 |
| 2.064026373408505 | 0.683 | -0.58 | -0.001 |
| 2.067167966062094 | 0.68 | -0.587 | -0.001 |
| 2.070309558715684 | 0.676 | -0.595 | 0 |
| 2.073451151369273 | 0.673 | -0.602 | 0 |
| 2.076592744022863 | 0.669 | -0.609 | 0 |
| 2.079734336676452 | 0.666 | -0.616 | 0 |
| 2.082875929330042 | 0.662 | -0.623 | 0 |
| 2.086017521983632 | 0.659 | -0.631 | 0 |
| 2.089159114637221 | 0.655 | -0.638 | 0 |
| 2.092300707290811 | 0.652 | -0.645 | 0 |
| 2.095442299944401 | 0.648 | -0.652 | 0 |
| 2.09858389259799 | 0.645 | -0.659 | 0 |
| 2.10172548525158 | 0.641 | -0.666 | 0 |
| 2.104867077905169 | 0.638 | -0.673 | 0 |
| 2.108008670558759 | 0.634 | -0.68 | 0 |
| 2.111150263212349 | 0.631 | -0.687 | 0 |
| 2.114291855865938 | 0.627 | -0.694 | 0 |
| 2.117433448519528 | 0.623 | -0.701 | 0 |
| 2.120575041173117 | 0.62 | -0.707 | 0 |
| 2.123716633826707 | 0.616 | -0.714 | 0.001 |
| 2.126858226480297 | 0.613 | -0.721 | 0.001 |
| 2.129999819133886 | 0.609 | -0.728 | 0.001 |
| 2.133141411787476 | 0.606 | -0.734 | 0.002 |
| 2.136283004441065 | 0.602 | -0.741 | 0.002 |
| 2.139424597094655 | 0.598 | -0.747 | 0.002 |
| 2.142566189748245 | 0.595 | -0.754 | 0.003 |
| 2.145707782401834 | 0.591 | -0.76 | 0.004 |
| 2.148849375055424 | 0.587 | -0.767 | 0.004 |
| 2.151990967709013 | 0.584 | -0.773 | 0.005 |
| 2.155132560362603 | 0.58 | -0.779 | 0.006 |
| 2.158274153016193 | 0.577 | -0.785 | 0.007 |
| 2.161415745669782 | 0.573 | -0.792 | 0.008 |
| 2.164557338323372 | 0.569 | -0.798 | 0.009 |
| 2.167698930976961 | 0.566 | -0.804 | 0.01 |
| 2.170840523630551 | 0.562 | -0.81 | 0.012 |
| 2.173982116284141 | 0.559 | -0.816 | 0.013 |
| 2.17712370893773 | 0.555 | -0.821 | 0.015 |
| 2.18026530159132 | 0.551 | -0.827 | 0.017 |
| 2.183406894244909 | 0.548 | -0.833 | 0.018 |
| 2.186548486898499 | 0.544 | -0.839 | 0.02 |
| 2.189690079552089 | 0.54 | -0.844 | 0.022 |
| 2.192831672205678 | 0.537 | -0.85 | 0.025 |
| 2.195973264859268 | 0.533 | -0.855 | 0.027 |
| 2.199114857512857 | 0.53 | -0.86 | 0.03 |
| 2.202256450166447 | 0.526 | -0.865 | 0.032 |
| 2.205398042820036 | 0.522 | -0.871 | 0.035 |
| 2.208539635473626 | 0.519 | -0.876 | 0.038 |
| 2.211681228127216 | 0.515 | -0.881 | 0.041 |
| 2.214822820780805 | 0.511 | -0.886 | 0.044 |
| 2.217964413434395 | 0.508 | -0.89 | 0.048 |
| 2.221106006087984 | 0.504 | -0.895 | 0.051 |
| 2.224247598741574 | 0.501 | -0.9 | 0.055 |
| 2.227389191395164 | 0.497 | -0.904 | 0.059 |
| 2.230530784048753 | 0.493 | -0.909 | 0.063 |
| 2.233672376702343 | 0.49 | -0.913 | 0.067 |
| 2.236813969355933 | 0.486 | -0.917 | 0.071 |
| 2.239955562009522 | 0.483 | -0.921 | 0.076 |
| 2.243097154663112 | 0.479 | -0.926 | 0.08 |
| 2.246238747316701 | 0.475 | -0.929 | 0.085 |
| 2.249380339970291 | 0.472 | -0.933 | 0.09 |
| 2.252521932623881 | 0.468 | -0.937 | 0.095 |
| 2.25566352527747 | 0.465 | -0.941 | 0.101 |
| 2.25880511793106 | 0.461 | -0.944 | 0.106 |
| 2.261946710584649 | 0.457 | -0.948 | 0.112 |
| 2.265088303238239 | 0.454 | -0.951 | 0.118 |
| 2.268229895891829 | 0.45 | -0.954 | 0.124 |
| 2.271371488545418 | 0.447 | -0.958 | 0.13 |
| 2.274513081199008 | 0.443 | -0.961 | 0.136 |
| 2.277654673852597 | 0.44 | -0.964 | 0.143 |
| 2.280796266506186 | 0.436 | -0.966 | 0.149 |
| 2.283937859159776 | 0.433 | -0.969 | 0.156 |
| 2.287079451813366 | 0.429 | -0.972 | 0.163 |
| 2.290221044466955 | 0.426 | -0.974 | 0.17 |
| 2.293362637120545 | 0.422 | -0.977 | 0.178 |
| 2.296504229774135 | 0.419 | -0.979 | 0.185 |
| 2.299645822427724 | 0.415 | -0.981 | 0.193 |
| 2.302787415081314 | 0.412 | -0.983 | 0.2 |
| 2.305929007734904 | 0.408 | -0.985 | 0.208 |
| 2.309070600388493 | 0.405 | -0.987 | 0.216 |
| 2.312212193042083 | 0.401 | -0.988 | 0.225 |
| 2.315353785695672 | 0.398 | -0.99 | 0.233 |
| 2.318495378349262 | 0.394 | -0.992 | 0.242 |
| 2.321636971002852 | 0.391 | -0.993 | 0.25 |
| 2.324778563656441 | 0.387 | -0.994 | 0.259 |
| 2.327920156310031 | 0.384 | -0.995 | 0.268 |
| 2.33106174896362 | 0.381 | -0.996 | 0.277 |
| 2.33420334161721 | 0.377 | -0.997 | 0.286 |
| 2.3373449342708 | 0.374 | -0.998 | 0.295 |
| 2.340486526924389 | 0.37 | -0.999 | 0.305 |
| 2.343628119577979 | 0.367 | -0.999 | 0.314 |
| 2.346769712231568 | 0.364 | -0.999 | 0.324 |
| 2.349911304885158 | 0.36 | -1 | 0.334 |
| 2.353052897538748 | 0.357 | -1 | 0.344 |
| 2.356194490192337 | 0.354 | -1 | 0.354 |
| 2.359336082845927 | 0.35 | -1 | 0.364 |
| 2.362477675499516 | 0.347 | -1 | 0.374 |
| 2.365619268153106 | 0.344 | -0.999 | 0.384 |
| 2.368760860806696 | 0.34 | -0.999 | 0.394 |
| 2.371902453460285 | 0.337 | -0.999 | 0.405 |
| 2.375044046113875 | 0.334 | -0.998 | 0.415 |
| 2.378185638767464 | 0.33 | -0.997 | 0.426 |
| 2.381327231421054 | 0.327 | -0.996 | 0.436 |
| 2.384468824074644 | 0.324 | -0.995 | 0.447 |
| 2.387610416728233 | 0.321 | -0.994 | 0.457 |
| 2.390752009381823 | 0.318 | -0.993 | 0.468 |
| 2.393893602035412 | 0.314 | -0.992 | 0.479 |
| 2.397035194689002 | 0.311 | -0.99 | 0.49 |
| 2.400176787342591 | 0.308 | -0.988 | 0.501 |
| 2.403318379996181 | 0.305 | -0.987 | 0.511 |
| 2.406459972649771 | 0.302 | -0.985 | 0.522 |
| 2.40960156530336 | 0.299 | -0.983 | 0.533 |
| 2.41274315795695 | 0.295 | -0.981 | 0.544 |
| 2.41588475061054 | 0.292 | -0.979 | 0.555 |
| 2.419026343264129 | 0.289 | -0.977 | 0.566 |
| 2.422167935917719 | 0.286 | -0.974 | 0.577 |
| 2.425309528571308 | 0.283 | -0.972 | 0.587 |
| 2.428451121224898 | 0.28 | -0.969 | 0.598 |
| 2.431592713878488 | 0.277 | -0.966 | 0.609 |
| 2.434734306532077 | 0.274 | -0.964 | 0.62 |
| 2.437875899185667 | 0.271 | -0.961 | 0.631 |
| 2.441017491839256 | 0.268 | -0.958 | 0.641 |
| 2.444159084492846 | 0.265 | -0.954 | 0.652 |
| 2.447300677146435 | 0.262 | -0.951 | 0.662 |
| 2.450442269800025 | 0.259 | -0.948 | 0.673 |
| 2.453583862453615 | 0.256 | -0.944 | 0.683 |
| 2.456725455107204 | 0.253 | -0.941 | 0.694 |
| 2.459867047760794 | 0.25 | -0.937 | 0.704 |
| 2.463008640414384 | 0.247 | -0.933 | 0.714 |
| 2.466150233067973 | 0.244 | -0.929 | 0.724 |
| 2.469291825721563 | 0.242 | -0.926 | 0.734 |
| 2.472433418375152 | 0.239 | -0.921 | 0.744 |
| 2.475575011028742 | 0.236 | -0.917 | 0.754 |
| 2.478716603682332 | 0.233 | -0.913 | 0.763 |
| 2.481858196335921 | 0.23 | -0.909 | 0.773 |
| 2.48499978898951 | 0.227 | -0.904 | 0.782 |
| 2.4881413816431 | 0.225 | -0.9 | 0.792 |
| 2.49128297429669 | 0.222 | -0.895 | 0.801 |
| 2.49442456695028 | 0.219 | -0.89 | 0.81 |
| 2.497566159603869 | 0.216 | -0.886 | 0.819 |
| 2.500707752257458 | 0.214 | -0.881 | 0.827 |
| 2.503849344911048 | 0.211 | -0.876 | 0.836 |
| 2.506990937564638 | 0.208 | -0.871 | 0.844 |
| 2.510132530218228 | 0.206 | -0.865 | 0.852 |
| 2.513274122871817 | 0.203 | -0.86 | 0.86 |
| 2.516415715525407 | 0.2 | -0.855 | 0.868 |
| 2.519557308178996 | 0.198 | -0.85 | 0.876 |
| 2.522698900832586 | 0.195 | -0.844 | 0.883 |
| 2.525840493486176 | 0.193 | -0.839 | 0.89 |
| 2.528982086139765 | 0.19 | -0.833 | 0.897 |
| 2.532123678793355 | 0.188 | -0.827 | 0.904 |
| 2.535265271446944 | 0.185 | -0.821 | 0.911 |
| 2.538406864100534 | 0.183 | -0.816 | 0.917 |
| 2.541548456754124 | 0.18 | -0.81 | 0.923 |
| 2.544690049407713 | 0.178 | -0.804 | 0.929 |
| 2.547831642061302 | 0.175 | -0.798 | 0.935 |
| 2.550973234714892 | 0.173 | -0.792 | 0.941 |
| 2.554114827368482 | 0.17 | -0.785 | 0.946 |
| 2.557256420022072 | 0.168 | -0.779 | 0.951 |
| 2.560398012675661 | 0.165 | -0.773 | 0.956 |
| 2.563539605329251 | 0.163 | -0.767 | 0.961 |
| 2.56668119798284 | 0.161 | -0.76 | 0.965 |
| 2.56982279063643 | 0.158 | -0.754 | 0.969 |
| 2.57296438329002 | 0.156 | -0.747 | 0.973 |
| 2.576105975943609 | 0.154 | -0.741 | 0.977 |
| 2.579247568597199 | 0.152 | -0.734 | 0.98 |
| 2.582389161250788 | 0.149 | -0.728 | 0.983 |
| 2.585530753904377 | 0.147 | -0.721 | 0.986 |
| 2.588672346557967 | 0.145 | -0.714 | 0.988 |
| 2.591813939211557 | 0.143 | -0.707 | 0.991 |
| 2.594955531865147 | 0.14 | -0.701 | 0.993 |
| 2.598097124518736 | 0.138 | -0.694 | 0.995 |
| 2.601238717172326 | 0.136 | -0.687 | 0.996 |
| 2.604380309825915 | 0.134 | -0.68 | 0.998 |
| 2.607521902479505 | 0.132 | -0.673 | 0.999 |
| 2.610663495133095 | 0.13 | -0.666 | 0.999 |
| 2.613805087786684 | 0.128 | -0.659 | 1 |
| 2.616946680440274 | 0.126 | -0.652 | 1 |
| 2.620088273093863 | 0.124 | -0.645 | 1 |
| 2.623229865747452 | 0.122 | -0.638 | 1 |
| 2.626371458401042 | 0.12 | -0.631 | 0.999 |
| 2.629513051054632 | 0.118 | -0.623 | 0.998 |
| 2.632654643708222 | 0.116 | -0.616 | 0.997 |
| 2.635796236361811 | 0.114 | -0.609 | 0.996 |
| 2.638937829015401 | 0.112 | -0.602 | 0.994 |
| 2.642079421668991 | 0.11 | -0.595 | 0.992 |
| 2.64522101432258 | 0.108 | -0.587 | 0.99 |
| 2.64836260697617 | 0.106 | -0.58 | 0.988 |
| 2.651504199629759 | 0.104 | -0.573 | 0.985 |
| 2.654645792283349 | 0.102 | -0.566 | 0.982 |
| 2.657787384936938 | 0.101 | -0.559 | 0.979 |
| 2.660928977590528 | 0.099 | -0.551 | 0.975 |
| 2.664070570244118 | 0.097 | -0.544 | 0.972 |
| 2.667212162897707 | 0.095 | -0.537 | 0.968 |
| 2.670353755551297 | 0.094 | -0.53 | 0.964 |
| 2.673495348204887 | 0.092 | -0.522 | 0.959 |
| 2.676636940858476 | 0.09 | -0.515 | 0.954 |
| 2.679778533512066 | 0.088 | -0.508 | 0.949 |
| 2.682920126165655 | 0.087 | -0.501 | 0.944 |
| 2.686061718819245 | 0.085 | -0.493 | 0.939 |
| 2.689203311472835 | 0.084 | -0.486 | 0.933 |
| 2.692344904126424 | 0.082 | -0.479 | 0.928 |
| 2.695486496780014 | 0.08 | -0.472 | 0.921 |
| 2.698628089433603 | 0.079 | -0.465 | 0.915 |
| 2.701769682087193 | 0.077 | -0.457 | 0.909 |
| 2.704911274740782 | 0.076 | -0.45 | 0.902 |
| 2.708052867394372 | 0.074 | -0.443 | 0.895 |
| 2.711194460047962 | 0.073 | -0.436 | 0.888 |
| 2.714336052701551 | 0.071 | -0.429 | 0.881 |
| 2.717477645355141 | 0.07 | -0.422 | 0.873 |
| 2.720619238008731 | 0.068 | -0.415 | 0.865 |
| 2.72376083066232 | 0.067 | -0.408 | 0.858 |
| 2.72690242331591 | 0.065 | -0.401 | 0.85 |
| 2.730044015969499 | 0.064 | -0.394 | 0.841 |
| 2.733185608623089 | 0.063 | -0.387 | 0.833 |
| 2.736327201276678 | 0.061 | -0.381 | 0.824 |
| 2.739468793930268 | 0.06 | -0.374 | 0.816 |
| 2.742610386583858 | 0.059 | -0.367 | 0.807 |
| 2.745751979237447 | 0.057 | -0.36 | 0.798 |
| 2.748893571891036 | 0.056 | -0.354 | 0.789 |
| 2.752035164544627 | 0.055 | -0.347 | 0.779 |
| 2.755176757198216 | 0.054 | -0.34 | 0.77 |
| 2.758318349851806 | 0.052 | -0.334 | 0.76 |
| 2.761459942505395 | 0.051 | -0.327 | 0.751 |
| 2.764601535158985 | 0.05 | -0.321 | 0.741 |
| 2.767743127812574 | 0.049 | -0.314 | 0.731 |
| 2.770884720466164 | 0.048 | -0.308 | 0.721 |
| 2.774026313119754 | 0.046 | -0.302 | 0.711 |
| 2.777167905773343 | 0.045 | -0.295 | 0.701 |
| 2.780309498426932 | 0.044 | -0.289 | 0.69 |
| 2.783451091080522 | 0.043 | -0.283 | 0.68 |
| 2.786592683734112 | 0.042 | -0.277 | 0.669 |
| 2.789734276387701 | 0.041 | -0.271 | 0.659 |
| 2.792875869041291 | 0.04 | -0.265 | 0.648 |
| 2.796017461694881 | 0.039 | -0.259 | 0.638 |
| 2.79915905434847 | 0.038 | -0.253 | 0.627 |
| 2.80230064700206 | 0.037 | -0.247 | 0.616 |
| 2.80544223965565 | 0.036 | -0.242 | 0.606 |
| 2.808583832309239 | 0.035 | -0.236 | 0.595 |
| 2.811725424962829 | 0.034 | -0.23 | 0.584 |
| 2.814867017616419 | 0.033 | -0.225 | 0.573 |
| 2.818008610270008 | 0.032 | -0.219 | 0.562 |
| 2.821150202923598 | 0.031 | -0.214 | 0.551 |
| 2.824291795577187 | 0.03 | -0.208 | 0.54 |
| 2.827433388230777 | 0.03 | -0.203 | 0.53 |
| 2.830574980884366 | 0.029 | -0.198 | 0.519 |
| 2.833716573537956 | 0.028 | -0.193 | 0.508 |
| 2.836858166191546 | 0.027 | -0.188 | 0.497 |
| 2.839999758845135 | 0.026 | -0.183 | 0.486 |
| 2.843141351498725 | 0.025 | -0.178 | 0.475 |
| 2.846282944152314 | 0.025 | -0.173 | 0.465 |
| 2.849424536805904 | 0.024 | -0.168 | 0.454 |
| 2.852566129459494 | 0.023 | -0.163 | 0.443 |
| 2.855707722113083 | 0.022 | -0.158 | 0.433 |
| 2.858849314766673 | 0.022 | -0.154 | 0.422 |
| 2.861990907420262 | 0.021 | -0.149 | 0.412 |
| 2.865132500073852 | 0.02 | -0.145 | 0.401 |
| 2.868274092727442 | 0.02 | -0.14 | 0.391 |
| 2.871415685381031 | 0.019 | -0.136 | 0.381 |
| 2.874557278034621 | 0.018 | -0.132 | 0.37 |
| 2.87769887068821 | 0.018 | -0.128 | 0.36 |
| 2.8808404633418 | 0.017 | -0.124 | 0.35 |
| 2.88398205599539 | 0.017 | -0.12 | 0.34 |
| 2.88712364864898 | 0.016 | -0.116 | 0.33 |
| 2.890265241302569 | 0.015 | -0.112 | 0.321 |
| 2.893406833956158 | 0.015 | -0.108 | 0.311 |
| 2.896548426609748 | 0.014 | -0.104 | 0.302 |
| 2.899690019263338 | 0.014 | -0.101 | 0.292 |
| 2.902831611916927 | 0.013 | -0.097 | 0.283 |
| 2.905973204570517 | 0.013 | -0.094 | 0.274 |
| 2.909114797224106 | 0.012 | -0.09 | 0.265 |
| 2.912256389877696 | 0.012 | -0.087 | 0.256 |
| 2.915397982531286 | 0.011 | -0.084 | 0.247 |
| 2.918539575184875 | 0.011 | -0.08 | 0.239 |
| 2.921681167838465 | 0.01 | -0.077 | 0.23 |
| 2.924822760492054 | 0.01 | -0.074 | 0.222 |
| 2.927964353145644 | 0.01 | -0.071 | 0.214 |
| 2.931105945799234 | 0.009 | -0.068 | 0.206 |
| 2.934247538452823 | 0.009 | -0.065 | 0.198 |
| 2.937389131106413 | 0.008 | -0.063 | 0.19 |
| 2.940530723760002 | 0.008 | -0.06 | 0.183 |
| 2.943672316413592 | 0.008 | -0.057 | 0.175 |
| 2.946813909067182 | 0.007 | -0.055 | 0.168 |
| 2.949955501720771 | 0.007 | -0.052 | 0.161 |
| 2.953097094374361 | 0.007 | -0.05 | 0.154 |
| 2.95623868702795 | 0.006 | -0.048 | 0.147 |
| 2.95938027968154 | 0.006 | -0.045 | 0.14 |
| 2.96252187233513 | 0.006 | -0.043 | 0.134 |
| 2.965663464988719 | 0.005 | -0.041 | 0.128 |
| 2.968805057642309 | 0.005 | -0.039 | 0.122 |
| 2.971946650295898 | 0.005 | -0.037 | 0.116 |
| 2.975088242949488 | 0.005 | -0.035 | 0.11 |
| 2.978229835603078 | 0.004 | -0.033 | 0.104 |
| 2.981371428256667 | 0.004 | -0.031 | 0.099 |
| 2.984513020910257 | 0.004 | -0.03 | 0.094 |
| 2.987654613563846 | 0.004 | -0.028 | 0.088 |
| 2.990796206217436 | 0.003 | -0.026 | 0.084 |
| 2.993937798871025 | 0.003 | -0.025 | 0.079 |
| 2.997079391524615 | 0.003 | -0.023 | 0.074 |
| 3.000220984178205 | 0.003 | -0.022 | 0.07 |
| 3.003362576831794 | 0.003 | -0.02 | 0.065 |
| 3.006504169485384 | 0.002 | -0.019 | 0.061 |
| 3.009645762138974 | 0.002 | -0.018 | 0.057 |
| 3.012787354792563 | 0.002 | -0.017 | 0.054 |
| 3.015928947446153 | 0.002 | -0.015 | 0.05 |
| 3.019070540099742 | 0.002 | -0.014 | 0.046 |
| 3.022212132753332 | 0.002 | -0.013 | 0.043 |
| 3.025353725406922 | 0.002 | -0.012 | 0.04 |
| 3.028495318060511 | 0.001 | -0.011 | 0.037 |
| 3.031636910714101 | 0.001 | -0.01 | 0.034 |
| 3.03477850336769 | 0.001 | -0.01 | 0.031 |
| 3.03792009602128 | 0.001 | -0.009 | 0.029 |
| 3.04106168867487 | 0.001 | -0.008 | 0.026 |
| 3.04420328132846 | 0.001 | -0.007 | 0.024 |
| 3.047344873982049 | 0.001 | -0.007 | 0.022 |
| 3.050486466635638 | 0.001 | -0.006 | 0.02 |
| 3.053628059289228 | 0.001 | -0.005 | 0.018 |
| 3.056769651942818 | 0.001 | -0.005 | 0.016 |
| 3.059911244596407 | 0.001 | -0.004 | 0.014 |
| 3.063052837249997 | 0 | -0.004 | 0.013 |
| 3.066194429903586 | 0 | -0.003 | 0.011 |
| 3.069336022557176 | 0 | -0.003 | 0.01 |
| 3.072477615210766 | 0 | -0.003 | 0.009 |
| 3.075619207864355 | 0 | -0.002 | 0.008 |
| 3.078760800517945 | 0 | -0.002 | 0.007 |
| 3.081902393171534 | 0 | -0.002 | 0.006 |
| 3.085043985825124 | 0 | -0.001 | 0.005 |
| 3.088185578478713 | 0 | -0.001 | 0.004 |
| 3.091327171132303 | 0 | -0.001 | 0.003 |
| 3.094468763785893 | 0 | -0.001 | 0.003 |
| 3.097610356439482 | 0 | -0.001 | 0.002 |
| 3.100751949093072 | 0 | -0.001 | 0.002 |
| 3.103893541746661 | 0 | 0 | 0.001 |
| 3.107035134400251 | 0 | 0 | 0.001 |
| 3.110176727053841 | 0 | 0 | 0.001 |
| 3.11331831970743 | 0 | 0 | 0.001 |
| 3.11645991236102 | 0 | 0 | 0 |
| 3.11960150501461 | 0 | 0 | 0 |
| 3.122743097668199 | 0 | 0 | 0 |
| 3.125884690321789 | 0 | 0 | 0 |
| 3.129026282975378 | 0 | 0 | 0 |
| 3.132167875628968 | 0 | 0 | 0 |
| 3.135309468282557 | 0 | 0 | 0 |
| 3.138451060936147 | 0 | 0 | 0 |
| 3.141592653589737 | 0 | 0 | 0 |
| 3.144734246243326 | 0 | 0 | 0 |
| 3.147875838896916 | 0 | 0 | 0 |
| 3.151017431550505 | 0 | 0 | 0 |
| 3.154159024204095 | 0 | 0 | 0 |
| 3.157300616857685 | 0 | 0 | 0 |
| 3.160442209511274 | 0 | 0 | 0 |
| 3.163583802164864 | 0 | 0 | 0 |
| 3.166725394818453 | 0 | 0 | 0 |
| 3.169866987472043 | 0 | 0 | -0.001 |
| 3.173008580125633 | 0 | 0 | -0.001 |
| 3.176150172779222 | 0 | 0 | -0.001 |
| 3.179291765432812 | 0 | 0 | -0.001 |
| 3.182433358086401 | 0 | 0.001 | -0.002 |
| 3.185574950739991 | 0 | 0.001 | -0.002 |
| 3.188716543393581 | 0 | 0.001 | -0.003 |
| 3.19185813604717 | 0 | 0.001 | -0.003 |
| 3.19499972870076 | 0 | 0.001 | -0.004 |
| 3.198141321354349 | 0 | 0.001 | -0.005 |
| 3.20128291400794 | 0 | 0.002 | -0.006 |
| 3.204424506661528 | 0 | 0.002 | -0.007 |
| 3.207566099315118 | 0 | 0.002 | -0.008 |
| 3.210707691968708 | 0 | 0.003 | -0.009 |
| 3.213849284622297 | 0 | 0.003 | -0.01 |
| 3.216990877275887 | 0 | 0.003 | -0.011 |
| 3.220132469929476 | 0 | 0.004 | -0.013 |
| 3.223274062583066 | -0.001 | 0.004 | -0.014 |
| 3.226415655236656 | -0.001 | 0.005 | -0.016 |
| 3.229557247890245 | -0.001 | 0.005 | -0.018 |
| 3.232698840543835 | -0.001 | 0.006 | -0.02 |
| 3.235840433197425 | -0.001 | 0.007 | -0.022 |
| 3.238982025851014 | -0.001 | 0.007 | -0.024 |
| 3.242123618504604 | -0.001 | 0.008 | -0.026 |
| 3.245265211158193 | -0.001 | 0.009 | -0.029 |
| 3.248406803811783 | -0.001 | 0.01 | -0.031 |
| 3.251548396465373 | -0.001 | 0.01 | -0.034 |
| 3.254689989118962 | -0.001 | 0.011 | -0.037 |
| 3.257831581772551 | -0.002 | 0.012 | -0.04 |
| 3.260973174426141 | -0.002 | 0.013 | -0.043 |
| 3.26411476707973 | -0.002 | 0.014 | -0.046 |
| 3.267256359733321 | -0.002 | 0.015 | -0.05 |
| 3.27039795238691 | -0.002 | 0.017 | -0.054 |
| 3.2735395450405 | -0.002 | 0.018 | -0.057 |
| 3.276681137694089 | -0.002 | 0.019 | -0.061 |
| 3.279822730347679 | -0.003 | 0.02 | -0.065 |
| 3.282964323001269 | -0.003 | 0.022 | -0.07 |
| 3.286105915654858 | -0.003 | 0.023 | -0.074 |
| 3.289247508308448 | -0.003 | 0.025 | -0.079 |
| 3.292389100962037 | -0.003 | 0.026 | -0.084 |
| 3.295530693615627 | -0.004 | 0.028 | -0.088 |
| 3.298672286269217 | -0.004 | 0.03 | -0.094 |
| 3.301813878922806 | -0.004 | 0.031 | -0.099 |
| 3.304955471576396 | -0.004 | 0.033 | -0.104 |
| 3.308097064229985 | -0.005 | 0.035 | -0.11 |
| 3.311238656883575 | -0.005 | 0.037 | -0.116 |
| 3.314380249537165 | -0.005 | 0.039 | -0.122 |
| 3.317521842190754 | -0.005 | 0.041 | -0.128 |
| 3.320663434844344 | -0.006 | 0.043 | -0.134 |
| 3.323805027497933 | -0.006 | 0.045 | -0.14 |
| 3.326946620151523 | -0.006 | 0.048 | -0.147 |
| 3.330088212805113 | -0.007 | 0.05 | -0.154 |
| 3.333229805458702 | -0.007 | 0.052 | -0.161 |
| 3.336371398112292 | -0.007 | 0.055 | -0.168 |
| 3.339512990765881 | -0.008 | 0.057 | -0.175 |
| 3.342654583419471 | -0.008 | 0.06 | -0.183 |
| 3.345796176073061 | -0.008 | 0.063 | -0.19 |
| 3.34893776872665 | -0.009 | 0.065 | -0.198 |
| 3.35207936138024 | -0.009 | 0.068 | -0.206 |
| 3.355220954033829 | -0.01 | 0.071 | -0.214 |
| 3.358362546687419 | -0.01 | 0.074 | -0.222 |
| 3.361504139341009 | -0.01 | 0.077 | -0.23 |
| 3.364645731994598 | -0.011 | 0.08 | -0.239 |
| 3.367787324648188 | -0.011 | 0.084 | -0.247 |
| 3.370928917301777 | -0.012 | 0.087 | -0.256 |
| 3.374070509955367 | -0.012 | 0.09 | -0.265 |
| 3.377212102608956 | -0.013 | 0.094 | -0.274 |
| 3.380353695262546 | -0.013 | 0.097 | -0.283 |
| 3.383495287916136 | -0.014 | 0.101 | -0.292 |
| 3.386636880569725 | -0.014 | 0.104 | -0.302 |
| 3.389778473223315 | -0.015 | 0.108 | -0.311 |
| 3.392920065876904 | -0.015 | 0.112 | -0.321 |
| 3.396061658530494 | -0.016 | 0.116 | -0.33 |
| 3.399203251184084 | -0.017 | 0.12 | -0.34 |
| 3.402344843837673 | -0.017 | 0.124 | -0.35 |
| 3.405486436491263 | -0.018 | 0.128 | -0.36 |
| 3.408628029144852 | -0.018 | 0.132 | -0.37 |
| 3.411769621798442 | -0.019 | 0.136 | -0.381 |
| 3.414911214452032 | -0.02 | 0.14 | -0.391 |
| 3.418052807105621 | -0.02 | 0.145 | -0.401 |
| 3.421194399759211 | -0.021 | 0.149 | -0.412 |
| 3.4243359924128 | -0.022 | 0.154 | -0.422 |
| 3.42747758506639 | -0.022 | 0.158 | -0.433 |
| 3.43061917771998 | -0.023 | 0.163 | -0.443 |
| 3.433760770373569 | -0.024 | 0.168 | -0.454 |
| 3.436902363027159 | -0.025 | 0.173 | -0.465 |
| 3.440043955680748 | -0.025 | 0.178 | -0.475 |
| 3.443185548334338 | -0.026 | 0.183 | -0.486 |
| 3.446327140987927 | -0.027 | 0.188 | -0.497 |
| 3.449468733641517 | -0.028 | 0.193 | -0.508 |
| 3.452610326295107 | -0.029 | 0.198 | -0.519 |
| 3.455751918948696 | -0.03 | 0.203 | -0.53 |
| 3.458893511602286 | -0.03 | 0.208 | -0.54 |
| 3.462035104255876 | -0.031 | 0.214 | -0.551 |
| 3.465176696909465 | -0.032 | 0.219 | -0.562 |
| 3.468318289563055 | -0.033 | 0.225 | -0.573 |
| 3.471459882216644 | -0.034 | 0.23 | -0.584 |
| 3.474601474870234 | -0.035 | 0.236 | -0.595 |
| 3.477743067523824 | -0.036 | 0.242 | -0.606 |
| 3.480884660177413 | -0.037 | 0.247 | -0.616 |
| 3.484026252831002 | -0.038 | 0.253 | -0.627 |
| 3.487167845484592 | -0.039 | 0.259 | -0.638 |
| 3.490309438138182 | -0.04 | 0.265 | -0.648 |
| 3.493451030791772 | -0.041 | 0.271 | -0.659 |
| 3.496592623445361 | -0.042 | 0.277 | -0.669 |
| 3.499734216098951 | -0.043 | 0.283 | -0.68 |
| 3.50287580875254 | -0.044 | 0.289 | -0.69 |
| 3.50601740140613 | -0.045 | 0.295 | -0.701 |
| 3.50915899405972 | -0.046 | 0.302 | -0.711 |
| 3.512300586713309 | -0.048 | 0.308 | -0.721 |
| 3.515442179366899 | -0.049 | 0.314 | -0.731 |
| 3.518583772020488 | -0.05 | 0.321 | -0.741 |
| 3.521725364674078 | -0.051 | 0.327 | -0.751 |
| 3.524866957327668 | -0.052 | 0.334 | -0.76 |
| 3.528008549981257 | -0.054 | 0.34 | -0.77 |
| 3.531150142634847 | -0.055 | 0.347 | -0.779 |
| 3.534291735288436 | -0.056 | 0.354 | -0.789 |
| 3.537433327942026 | -0.057 | 0.36 | -0.798 |
| 3.540574920595616 | -0.059 | 0.367 | -0.807 |
| 3.543716513249205 | -0.06 | 0.374 | -0.816 |
| 3.546858105902795 | -0.061 | 0.381 | -0.824 |
| 3.549999698556384 | -0.063 | 0.387 | -0.833 |
| 3.553141291209974 | -0.064 | 0.394 | -0.841 |
| 3.556282883863564 | -0.065 | 0.401 | -0.85 |
| 3.559424476517153 | -0.067 | 0.408 | -0.858 |
| 3.562566069170743 | -0.068 | 0.415 | -0.865 |
| 3.565707661824332 | -0.07 | 0.422 | -0.873 |
| 3.568849254477922 | -0.071 | 0.429 | -0.881 |
| 3.571990847131511 | -0.073 | 0.436 | -0.888 |
| 3.575132439785101 | -0.074 | 0.443 | -0.895 |
| 3.578274032438691 | -0.076 | 0.45 | -0.902 |
| 3.58141562509228 | -0.077 | 0.457 | -0.909 |
| 3.58455721774587 | -0.079 | 0.465 | -0.915 |
| 3.58769881039946 | -0.08 | 0.472 | -0.921 |
| 3.590840403053049 | -0.082 | 0.479 | -0.928 |
| 3.593981995706639 | -0.084 | 0.486 | -0.933 |
| 3.597123588360228 | -0.085 | 0.493 | -0.939 |
| 3.600265181013818 | -0.087 | 0.501 | -0.944 |
| 3.603406773667407 | -0.088 | 0.508 | -0.949 |
| 3.606548366320997 | -0.09 | 0.515 | -0.954 |
| 3.609689958974587 | -0.092 | 0.522 | -0.959 |
| 3.612831551628176 | -0.094 | 0.53 | -0.964 |
| 3.615973144281766 | -0.095 | 0.537 | -0.968 |
| 3.619114736935355 | -0.097 | 0.544 | -0.972 |
| 3.622256329588945 | -0.099 | 0.551 | -0.975 |
| 3.625397922242534 | -0.101 | 0.559 | -0.979 |
| 3.628539514896124 | -0.102 | 0.566 | -0.982 |
| 3.631681107549714 | -0.104 | 0.573 | -0.985 |
| 3.634822700203303 | -0.106 | 0.58 | -0.988 |
| 3.637964292856893 | -0.108 | 0.587 | -0.99 |
| 3.641105885510483 | -0.11 | 0.595 | -0.992 |
| 3.644247478164072 | -0.112 | 0.602 | -0.994 |
| 3.647389070817662 | -0.114 | 0.609 | -0.996 |
| 3.650530663471251 | -0.116 | 0.616 | -0.997 |
| 3.653672256124841 | -0.118 | 0.623 | -0.998 |
| 3.656813848778431 | -0.12 | 0.631 | -0.999 |
| 3.65995544143202 | -0.122 | 0.638 | -1 |
| 3.66309703408561 | -0.124 | 0.645 | -1 |
| 3.666238626739199 | -0.126 | 0.652 | -1 |
| 3.66938021939279 | -0.128 | 0.659 | -1 |
| 3.672521812046378 | -0.13 | 0.666 | -0.999 |
| 3.675663404699968 | -0.132 | 0.673 | -0.999 |
| 3.678804997353558 | -0.134 | 0.68 | -0.998 |
| 3.681946590007147 | -0.136 | 0.687 | -0.996 |
| 3.685088182660737 | -0.138 | 0.694 | -0.995 |
| 3.688229775314326 | -0.14 | 0.701 | -0.993 |
| 3.691371367967916 | -0.143 | 0.707 | -0.991 |
| 3.694512960621506 | -0.145 | 0.714 | -0.988 |
| 3.697654553275095 | -0.147 | 0.721 | -0.986 |
| 3.700796145928685 | -0.149 | 0.728 | -0.983 |
| 3.703937738582274 | -0.152 | 0.734 | -0.98 |
| 3.707079331235864 | -0.154 | 0.741 | -0.977 |
| 3.710220923889454 | -0.156 | 0.747 | -0.973 |
| 3.713362516543043 | -0.158 | 0.754 | -0.969 |
| 3.716504109196633 | -0.161 | 0.76 | -0.965 |
| 3.719645701850223 | -0.163 | 0.767 | -0.961 |
| 3.722787294503812 | -0.165 | 0.773 | -0.956 |
| 3.725928887157402 | -0.168 | 0.779 | -0.951 |
| 3.729070479810991 | -0.17 | 0.785 | -0.946 |
| 3.732212072464581 | -0.173 | 0.792 | -0.941 |
| 3.735353665118171 | -0.175 | 0.798 | -0.935 |
| 3.73849525777176 | -0.178 | 0.804 | -0.929 |
| 3.74163685042535 | -0.18 | 0.81 | -0.923 |
| 3.744778443078939 | -0.183 | 0.816 | -0.917 |
| 3.747920035732529 | -0.185 | 0.821 | -0.911 |
| 3.751061628386119 | -0.188 | 0.827 | -0.904 |
| 3.754203221039708 | -0.19 | 0.833 | -0.897 |
| 3.757344813693298 | -0.193 | 0.839 | -0.89 |
| 3.760486406346887 | -0.195 | 0.844 | -0.883 |
| 3.763627999000477 | -0.198 | 0.85 | -0.876 |
| 3.766769591654067 | -0.2 | 0.855 | -0.868 |
| 3.769911184307656 | -0.203 | 0.86 | -0.86 |
| 3.773052776961246 | -0.206 | 0.865 | -0.852 |
| 3.776194369614835 | -0.208 | 0.871 | -0.844 |
| 3.779335962268425 | -0.211 | 0.876 | -0.836 |
| 3.782477554922014 | -0.214 | 0.881 | -0.827 |
| 3.785619147575604 | -0.216 | 0.886 | -0.819 |
| 3.788760740229193 | -0.219 | 0.89 | -0.81 |
| 3.791902332882783 | -0.222 | 0.895 | -0.801 |
| 3.795043925536373 | -0.225 | 0.9 | -0.792 |
| 3.798185518189962 | -0.227 | 0.904 | -0.782 |
| 3.801327110843552 | -0.23 | 0.909 | -0.773 |
| 3.804468703497142 | -0.233 | 0.913 | -0.763 |
| 3.807610296150731 | -0.236 | 0.917 | -0.754 |
| 3.810751888804321 | -0.239 | 0.921 | -0.744 |
| 3.813893481457911 | -0.242 | 0.926 | -0.734 |
| 3.8170350741115 | -0.244 | 0.929 | -0.724 |
| 3.82017666676509 | -0.247 | 0.933 | -0.714 |
| 3.823318259418679 | -0.25 | 0.937 | -0.704 |
| 3.826459852072269 | -0.253 | 0.941 | -0.694 |
| 3.829601444725859 | -0.256 | 0.944 | -0.683 |
| 3.832743037379448 | -0.259 | 0.948 | -0.673 |
| 3.835884630033038 | -0.262 | 0.951 | -0.662 |
| 3.839026222686627 | -0.265 | 0.954 | -0.652 |
| 3.842167815340217 | -0.268 | 0.958 | -0.641 |
| 3.845309407993807 | -0.271 | 0.961 | -0.631 |
| 3.848451000647396 | -0.274 | 0.964 | -0.62 |
| 3.851592593300986 | -0.277 | 0.966 | -0.609 |
| 3.854734185954575 | -0.28 | 0.969 | -0.598 |
| 3.857875778608165 | -0.283 | 0.972 | -0.587 |
| 3.861017371261755 | -0.286 | 0.974 | -0.577 |
| 3.864158963915344 | -0.289 | 0.977 | -0.566 |
| 3.867300556568933 | -0.292 | 0.979 | -0.555 |
| 3.870442149222523 | -0.295 | 0.981 | -0.544 |
| 3.873583741876112 | -0.299 | 0.983 | -0.533 |
| 3.876725334529703 | -0.302 | 0.985 | -0.522 |
| 3.879866927183292 | -0.305 | 0.987 | -0.511 |
| 3.883008519836882 | -0.308 | 0.988 | -0.501 |
| 3.886150112490471 | -0.311 | 0.99 | -0.49 |
| 3.889291705144061 | -0.314 | 0.992 | -0.479 |
| 3.892433297797651 | -0.318 | 0.993 | -0.468 |
| 3.89557489045124 | -0.321 | 0.994 | -0.457 |
| 3.89871648310483 | -0.324 | 0.995 | -0.447 |
| 3.901858075758419 | -0.327 | 0.996 | -0.436 |
| 3.904999668412009 | -0.33 | 0.997 | -0.426 |
| 3.908141261065598 | -0.334 | 0.998 | -0.415 |
| 3.911282853719188 | -0.337 | 0.999 | -0.405 |
| 3.914424446372778 | -0.34 | 0.999 | -0.394 |
| 3.917566039026367 | -0.344 | 0.999 | -0.384 |
| 3.920707631679957 | -0.347 | 1 | -0.374 |
| 3.923849224333547 | -0.35 | 1 | -0.364 |
| 3.926990816987136 | -0.354 | 1 | -0.354 |
| 3.930132409640726 | -0.357 | 1 | -0.344 |
| 3.933274002294315 | -0.36 | 1 | -0.334 |
| 3.936415594947905 | -0.364 | 0.999 | -0.324 |
| 3.939557187601495 | -0.367 | 0.999 | -0.314 |
| 3.942698780255084 | -0.37 | 0.999 | -0.305 |
| 3.945840372908674 | -0.374 | 0.998 | -0.295 |
| 3.948981965562263 | -0.377 | 0.997 | -0.286 |
| 3.952123558215853 | -0.381 | 0.996 | -0.277 |
| 3.955265150869442 | -0.384 | 0.995 | -0.268 |
| 3.958406743523032 | -0.387 | 0.994 | -0.259 |
| 3.961548336176622 | -0.391 | 0.993 | -0.25 |
| 3.964689928830211 | -0.394 | 0.992 | -0.242 |
| 3.967831521483801 | -0.398 | 0.99 | -0.233 |
| 3.97097311413739 | -0.401 | 0.988 | -0.225 |
| 3.97411470679098 | -0.405 | 0.987 | -0.216 |
| 3.97725629944457 | -0.408 | 0.985 | -0.208 |
| 3.98039789209816 | -0.412 | 0.983 | -0.2 |
| 3.983539484751749 | -0.415 | 0.981 | -0.193 |
| 3.986681077405338 | -0.419 | 0.979 | -0.185 |
| 3.989822670058928 | -0.422 | 0.977 | -0.178 |
| 3.992964262712517 | -0.426 | 0.974 | -0.17 |
| 3.996105855366107 | -0.429 | 0.972 | -0.163 |
| 3.999247448019697 | -0.433 | 0.969 | -0.156 |
| 4.002389040673287 | -0.436 | 0.966 | -0.149 |
| 4.005530633326877 | -0.44 | 0.964 | -0.143 |
| 4.008672225980466 | -0.443 | 0.961 | -0.136 |
| 4.011813818634056 | -0.447 | 0.958 | -0.13 |
| 4.014955411287645 | -0.45 | 0.954 | -0.124 |
| 4.018097003941234 | -0.454 | 0.951 | -0.118 |
| 4.021238596594824 | -0.457 | 0.948 | -0.112 |
| 4.024380189248414 | -0.461 | 0.944 | -0.106 |
| 4.027521781902004 | -0.465 | 0.941 | -0.101 |
| 4.030663374555593 | -0.468 | 0.937 | -0.095 |
| 4.033804967209183 | -0.472 | 0.933 | -0.09 |
| 4.036946559862773 | -0.475 | 0.929 | -0.085 |
| 4.040088152516362 | -0.479 | 0.926 | -0.08 |
| 4.043229745169951 | -0.483 | 0.921 | -0.076 |
| 4.046371337823541 | -0.486 | 0.917 | -0.071 |
| 4.049512930477131 | -0.49 | 0.913 | -0.067 |
| 4.05265452313072 | -0.493 | 0.909 | -0.063 |
| 4.05579611578431 | -0.497 | 0.904 | -0.059 |
| 4.0589377084379 | -0.501 | 0.9 | -0.055 |
| 4.062079301091489 | -0.504 | 0.895 | -0.051 |
| 4.065220893745079 | -0.508 | 0.89 | -0.048 |
| 4.068362486398668 | -0.511 | 0.886 | -0.044 |
| 4.071504079052258 | -0.515 | 0.881 | -0.041 |
| 4.074645671705848 | -0.519 | 0.876 | -0.038 |
| 4.077787264359437 | -0.522 | 0.871 | -0.035 |
| 4.080928857013027 | -0.526 | 0.865 | -0.032 |
| 4.084070449666616 | -0.53 | 0.86 | -0.03 |
| 4.087212042320206 | -0.533 | 0.855 | -0.027 |
| 4.090353634973795 | -0.537 | 0.85 | -0.025 |
| 4.093495227627385 | -0.54 | 0.844 | -0.022 |
| 4.096636820280975 | -0.544 | 0.839 | -0.02 |
| 4.099778412934564 | -0.548 | 0.833 | -0.018 |
| 4.102920005588154 | -0.551 | 0.827 | -0.017 |
| 4.106061598241744 | -0.555 | 0.821 | -0.015 |
| 4.109203190895333 | -0.559 | 0.816 | -0.013 |
| 4.112344783548923 | -0.562 | 0.81 | -0.012 |
| 4.115486376202512 | -0.566 | 0.804 | -0.01 |
| 4.118627968856102 | -0.569 | 0.798 | -0.009 |
| 4.121769561509692 | -0.573 | 0.792 | -0.008 |
| 4.124911154163281 | -0.577 | 0.785 | -0.007 |
| 4.128052746816871 | -0.58 | 0.779 | -0.006 |
| 4.13119433947046 | -0.584 | 0.773 | -0.005 |
| 4.13433593212405 | -0.587 | 0.767 | -0.004 |
| 4.13747752477764 | -0.591 | 0.76 | -0.004 |
| 4.14061911743123 | -0.595 | 0.754 | -0.003 |
| 4.143760710084818 | -0.598 | 0.747 | -0.002 |
| 4.146902302738408 | -0.602 | 0.741 | -0.002 |
| 4.150043895391998 | -0.606 | 0.734 | -0.002 |
| 4.153185488045588 | -0.609 | 0.728 | -0.001 |
| 4.156327080699177 | -0.613 | 0.721 | -0.001 |
| 4.159468673352766 | -0.616 | 0.714 | -0.001 |
| 4.162610266006356 | -0.62 | 0.707 | 0 |
| 4.165751858659946 | -0.623 | 0.701 | 0 |
| 4.168893451313535 | -0.627 | 0.694 | 0 |
| 4.172035043967125 | -0.631 | 0.687 | 0 |
| 4.175176636620715 | -0.634 | 0.68 | 0 |
| 4.178318229274304 | -0.638 | 0.673 | 0 |
| 4.181459821927894 | -0.641 | 0.666 | 0 |
| 4.184601414581484 | -0.645 | 0.659 | 0 |
| 4.187743007235073 | -0.648 | 0.652 | 0 |
| 4.190884599888663 | -0.652 | 0.645 | 0 |
| 4.194026192542252 | -0.655 | 0.638 | 0 |
| 4.197167785195842 | -0.659 | 0.631 | 0 |
| 4.200309377849432 | -0.662 | 0.623 | 0 |
| 4.203450970503021 | -0.666 | 0.616 | 0 |
| 4.206592563156611 | -0.669 | 0.609 | 0 |
| 4.2097341558102 | -0.673 | 0.602 | 0 |
| 4.21287574846379 | -0.676 | 0.595 | 0 |
| 4.21601734111738 | -0.68 | 0.587 | 0.001 |
| 4.21915893377097 | -0.683 | 0.58 | 0.001 |
| 4.222300526424559 | -0.687 | 0.573 | 0.001 |
| 4.225442119078148 | -0.69 | 0.566 | 0.001 |
| 4.228583711731738 | -0.694 | 0.559 | 0.002 |
| 4.231725304385327 | -0.697 | 0.551 | 0.002 |
| 4.234866897038917 | -0.701 | 0.544 | 0.003 |
| 4.238008489692506 | -0.704 | 0.537 | 0.003 |
| 4.241150082346096 | -0.707 | 0.53 | 0.004 |
| 4.244291674999685 | -0.711 | 0.522 | 0.005 |
| 4.247433267653276 | -0.714 | 0.515 | 0.005 |
| 4.250574860306865 | -0.718 | 0.508 | 0.006 |
| 4.253716452960455 | -0.721 | 0.501 | 0.007 |
| 4.256858045614044 | -0.724 | 0.493 | 0.008 |
| 4.259999638267634 | -0.728 | 0.486 | 0.01 |
| 4.263141230921224 | -0.731 | 0.479 | 0.011 |
| 4.266282823574813 | -0.734 | 0.472 | 0.012 |
| 4.269424416228403 | -0.738 | 0.465 | 0.014 |
| 4.272566008881992 | -0.741 | 0.457 | 0.015 |
| 4.275707601535582 | -0.744 | 0.45 | 0.017 |
| 4.27884919418917 | -0.747 | 0.443 | 0.019 |
| 4.28199078684276 | -0.751 | 0.436 | 0.021 |
| 4.285132379496351 | -0.754 | 0.429 | 0.023 |
| 4.28827397214994 | -0.757 | 0.422 | 0.025 |
| 4.29141556480353 | -0.76 | 0.415 | 0.028 |
| 4.294557157457119 | -0.763 | 0.408 | 0.03 |
| 4.29769875011071 | -0.767 | 0.401 | 0.033 |
| 4.300840342764299 | -0.77 | 0.394 | 0.036 |
| 4.303981935417888 | -0.773 | 0.387 | 0.039 |
| 4.307123528071478 | -0.776 | 0.381 | 0.042 |
| 4.310265120725067 | -0.779 | 0.374 | 0.045 |
| 4.313406713378657 | -0.782 | 0.367 | 0.049 |
| 4.316548306032247 | -0.785 | 0.36 | 0.052 |
| 4.319689898685836 | -0.789 | 0.354 | 0.056 |
| 4.322831491339426 | -0.792 | 0.347 | 0.06 |
| 4.325973083993015 | -0.795 | 0.34 | 0.064 |
| 4.329114676646605 | -0.798 | 0.334 | 0.068 |
| 4.332256269300195 | -0.801 | 0.327 | 0.073 |
| 4.335397861953784 | -0.804 | 0.321 | 0.077 |
| 4.338539454607374 | -0.807 | 0.314 | 0.082 |
| 4.341681047260963 | -0.81 | 0.308 | 0.087 |
| 4.344822639914553 | -0.813 | 0.302 | 0.092 |
| 4.347964232568143 | -0.816 | 0.295 | 0.097 |
| 4.351105825221732 | -0.819 | 0.289 | 0.102 |
| 4.354247417875322 | -0.821 | 0.283 | 0.108 |
| 4.357389010528911 | -0.824 | 0.277 | 0.114 |
| 4.360530603182501 | -0.827 | 0.271 | 0.12 |
| 4.36367219583609 | -0.83 | 0.265 | 0.126 |
| 4.36681378848968 | -0.833 | 0.259 | 0.132 |
| 4.36995538114327 | -0.836 | 0.253 | 0.138 |
| 4.373096973796859 | -0.839 | 0.247 | 0.145 |
| 4.376238566450449 | -0.841 | 0.242 | 0.152 |
| 4.379380159104038 | -0.844 | 0.236 | 0.158 |
| 4.382521751757628 | -0.847 | 0.23 | 0.165 |
| 4.385663344411217 | -0.85 | 0.225 | 0.173 |
| 4.388804937064807 | -0.852 | 0.219 | 0.18 |
| 4.391946529718397 | -0.855 | 0.214 | 0.188 |
| 4.395088122371987 | -0.858 | 0.208 | 0.195 |
| 4.398229715025576 | -0.86 | 0.203 | 0.203 |
| 4.401371307679165 | -0.863 | 0.198 | 0.211 |
| 4.404512900332755 | -0.865 | 0.193 | 0.219 |
| 4.407654492986345 | -0.868 | 0.188 | 0.227 |
| 4.410796085639934 | -0.871 | 0.183 | 0.236 |
| 4.413937678293524 | -0.873 | 0.178 | 0.244 |
| 4.417079270947114 | -0.876 | 0.173 | 0.253 |
| 4.420220863600703 | -0.878 | 0.168 | 0.262 |
| 4.423362456254293 | -0.881 | 0.163 | 0.271 |
| 4.426504048907883 | -0.883 | 0.158 | 0.28 |
| 4.429645641561472 | -0.886 | 0.154 | 0.289 |
| 4.432787234215062 | -0.888 | 0.149 | 0.299 |
| 4.435928826868651 | -0.89 | 0.145 | 0.308 |
| 4.43907041952224 | -0.893 | 0.14 | 0.318 |
| 4.44221201217583 | -0.895 | 0.136 | 0.327 |
| 4.44535360482942 | -0.897 | 0.132 | 0.337 |
| 4.44849519748301 | -0.9 | 0.128 | 0.347 |
| 4.4516367901366 | -0.902 | 0.124 | 0.357 |
| 4.454778382790188 | -0.904 | 0.12 | 0.367 |
| 4.457919975443779 | -0.906 | 0.116 | 0.377 |
| 4.461061568097368 | -0.909 | 0.112 | 0.387 |
| 4.464203160750958 | -0.911 | 0.108 | 0.398 |
| 4.467344753404547 | -0.913 | 0.104 | 0.408 |
| 4.470486346058137 | -0.915 | 0.101 | 0.419 |
| 4.473627938711726 | -0.917 | 0.097 | 0.429 |
| 4.476769531365316 | -0.919 | 0.094 | 0.44 |
| 4.479911124018905 | -0.921 | 0.09 | 0.45 |
| 4.483052716672495 | -0.923 | 0.087 | 0.461 |
| 4.486194309326085 | -0.926 | 0.084 | 0.472 |
| 4.489335901979674 | -0.928 | 0.08 | 0.483 |
| 4.492477494633264 | -0.929 | 0.077 | 0.493 |
| 4.495619087286854 | -0.931 | 0.074 | 0.504 |
| 4.498760679940443 | -0.933 | 0.071 | 0.515 |
| 4.501902272594033 | -0.935 | 0.068 | 0.526 |
| 4.505043865247622 | -0.937 | 0.065 | 0.537 |
| 4.508185457901212 | -0.939 | 0.063 | 0.548 |
| 4.511327050554801 | -0.941 | 0.06 | 0.559 |
| 4.514468643208391 | -0.943 | 0.057 | 0.569 |
| 4.517610235861981 | -0.944 | 0.055 | 0.58 |
| 4.520751828515571 | -0.946 | 0.052 | 0.591 |
| 4.52389342116916 | -0.948 | 0.05 | 0.602 |
| 4.52703501382275 | -0.949 | 0.048 | 0.613 |
| 4.530176606476339 | -0.951 | 0.045 | 0.623 |
| 4.533318199129928 | -0.953 | 0.043 | 0.634 |
| 4.536459791783518 | -0.954 | 0.041 | 0.645 |
| 4.539601384437108 | -0.956 | 0.039 | 0.655 |
| 4.542742977090698 | -0.958 | 0.037 | 0.666 |
| 4.545884569744287 | -0.959 | 0.035 | 0.676 |
| 4.549026162397876 | -0.961 | 0.033 | 0.687 |
| 4.552167755051466 | -0.962 | 0.031 | 0.697 |
| 4.555309347705056 | -0.964 | 0.03 | 0.707 |
| 4.558450940358646 | -0.965 | 0.028 | 0.718 |
| 4.561592533012235 | -0.966 | 0.026 | 0.728 |
| 4.564734125665825 | -0.968 | 0.025 | 0.738 |
| 4.567875718319415 | -0.969 | 0.023 | 0.747 |
| 4.571017310973004 | -0.97 | 0.022 | 0.757 |
| 4.574158903626594 | -0.972 | 0.02 | 0.767 |
| 4.577300496280183 | -0.973 | 0.019 | 0.776 |
| 4.580442088933772 | -0.974 | 0.018 | 0.785 |
| 4.583583681587362 | -0.975 | 0.017 | 0.795 |
| 4.586725274240952 | -0.977 | 0.015 | 0.804 |
| 4.589866866894542 | -0.978 | 0.014 | 0.813 |
| 4.593008459548131 | -0.979 | 0.013 | 0.821 |
| 4.596150052201721 | -0.98 | 0.012 | 0.83 |
| 4.59929164485531 | -0.981 | 0.011 | 0.839 |
| 4.6024332375089 | -0.982 | 0.01 | 0.847 |
| 4.60557483016249 | -0.983 | 0.01 | 0.855 |
| 4.608716422816079 | -0.984 | 0.009 | 0.863 |
| 4.611858015469668 | -0.985 | 0.008 | 0.871 |
| 4.614999608123258 | -0.986 | 0.007 | 0.878 |
| 4.618141200776848 | -0.987 | 0.007 | 0.886 |
| 4.621282793430437 | -0.988 | 0.006 | 0.893 |
| 4.624424386084027 | -0.988 | 0.005 | 0.9 |
| 4.627565978737617 | -0.989 | 0.005 | 0.906 |
| 4.630707571391206 | -0.99 | 0.004 | 0.913 |
| 4.633849164044795 | -0.991 | 0.004 | 0.919 |
| 4.636990756698386 | -0.992 | 0.003 | 0.926 |
| 4.640132349351975 | -0.992 | 0.003 | 0.931 |
| 4.643273942005564 | -0.993 | 0.003 | 0.937 |
| 4.646415534659154 | -0.993 | 0.002 | 0.943 |
| 4.649557127312744 | -0.994 | 0.002 | 0.948 |
| 4.652698719966334 | -0.995 | 0.002 | 0.953 |
| 4.655840312619923 | -0.995 | 0.001 | 0.958 |
| 4.658981905273513 | -0.996 | 0.001 | 0.962 |
| 4.662123497927102 | -0.996 | 0.001 | 0.966 |
| 4.665265090580692 | -0.997 | 0.001 | 0.97 |
| 4.668406683234282 | -0.997 | 0.001 | 0.974 |
| 4.671548275887871 | -0.998 | 0.001 | 0.978 |
| 4.674689868541461 | -0.998 | 0 | 0.981 |
| 4.67783146119505 | -0.998 | 0 | 0.984 |
| 4.68097305384864 | -0.999 | 0 | 0.987 |
| 4.68411464650223 | -0.999 | 0 | 0.989 |
| 4.687256239155819 | -0.999 | 0 | 0.992 |
| 4.690397831809409 | -0.999 | 0 | 0.993 |
| 4.693539424462998 | -0.999 | 0 | 0.995 |
| 4.696681017116588 | -1 | 0 | 0.997 |
| 4.699822609770177 | -1 | 0 | 0.998 |
| 4.702964202423767 | -1 | 0 | 0.999 |
| 4.706105795077356 | -1 | 0 | 0.999 |
| 4.709247387730946 | -1 | 0 | 1 |
| 4.712388980384535 | -1 | 0 | 1 |
| 4.715530573038126 | -1 | 0 | 1 |
| 4.718672165691715 | -1 | 0 | 0.999 |
| 4.721813758345305 | -1 | 0 | 0.999 |
| 4.724955350998894 | -1 | 0 | 0.998 |
| 4.728096943652484 | -1 | 0 | 0.997 |
| 4.731238536306074 | -0.999 | 0 | 0.995 |
| 4.734380128959663 | -0.999 | 0 | 0.993 |
| 4.737521721613253 | -0.999 | 0 | 0.992 |
| 4.740663314266842 | -0.999 | 0 | 0.989 |
| 4.743804906920432 | -0.999 | 0 | 0.987 |
| 4.74694649957402 | -0.998 | 0 | 0.984 |
| 4.750088092227611 | -0.998 | 0 | 0.981 |
| 4.7532296848812 | -0.998 | -0.001 | 0.978 |
| 4.75637127753479 | -0.997 | -0.001 | 0.974 |
| 4.75951287018838 | -0.997 | -0.001 | 0.97 |
| 4.76265446284197 | -0.996 | -0.001 | 0.966 |
| 4.765796055495559 | -0.996 | -0.001 | 0.962 |
| 4.768937648149149 | -0.995 | -0.001 | 0.958 |
| 4.772079240802738 | -0.995 | -0.002 | 0.953 |
| 4.775220833456327 | -0.994 | -0.002 | 0.948 |
| 4.778362426109917 | -0.993 | -0.002 | 0.943 |
| 4.781504018763507 | -0.993 | -0.003 | 0.937 |
| 4.784645611417097 | -0.992 | -0.003 | 0.931 |
| 4.787787204070686 | -0.992 | -0.003 | 0.926 |
| 4.790928796724275 | -0.991 | -0.004 | 0.919 |
| 4.794070389377865 | -0.99 | -0.004 | 0.913 |
| 4.797211982031455 | -0.989 | -0.005 | 0.906 |
| 4.800353574685045 | -0.988 | -0.005 | 0.9 |
| 4.803495167338634 | -0.988 | -0.006 | 0.893 |
| 4.806636759992224 | -0.987 | -0.007 | 0.886 |
| 4.809778352645814 | -0.986 | -0.007 | 0.878 |
| 4.812919945299403 | -0.985 | -0.008 | 0.871 |
| 4.816061537952993 | -0.984 | -0.009 | 0.863 |
| 4.819203130606582 | -0.983 | -0.01 | 0.855 |
| 4.822344723260172 | -0.982 | -0.01 | 0.847 |
| 4.825486315913761 | -0.981 | -0.011 | 0.839 |
| 4.828627908567351 | -0.98 | -0.012 | 0.83 |
| 4.83176950122094 | -0.979 | -0.013 | 0.821 |
| 4.83491109387453 | -0.978 | -0.014 | 0.813 |
| 4.83805268652812 | -0.977 | -0.015 | 0.804 |
| 4.841194279181709 | -0.975 | -0.017 | 0.795 |
| 4.844335871835299 | -0.974 | -0.018 | 0.785 |
| 4.847477464488889 | -0.973 | -0.019 | 0.776 |
| 4.850619057142478 | -0.972 | -0.02 | 0.767 |
| 4.853760649796068 | -0.97 | -0.022 | 0.757 |
| 4.856902242449657 | -0.969 | -0.023 | 0.747 |
| 4.860043835103247 | -0.968 | -0.025 | 0.738 |
| 4.863185427756837 | -0.966 | -0.026 | 0.728 |
| 4.866327020410426 | -0.965 | -0.028 | 0.718 |
| 4.869468613064015 | -0.964 | -0.03 | 0.707 |
| 4.872610205717605 | -0.962 | -0.031 | 0.697 |
| 4.875751798371195 | -0.961 | -0.033 | 0.687 |
| 4.878893391024784 | -0.959 | -0.035 | 0.676 |
| 4.882034983678374 | -0.958 | -0.037 | 0.666 |
| 4.885176576331964 | -0.956 | -0.039 | 0.655 |
| 4.888318168985553 | -0.954 | -0.041 | 0.645 |
| 4.891459761639143 | -0.953 | -0.043 | 0.634 |
| 4.894601354292733 | -0.951 | -0.045 | 0.623 |
| 4.897742946946322 | -0.949 | -0.048 | 0.613 |
| 4.900884539599912 | -0.948 | -0.05 | 0.602 |
| 4.904026132253501 | -0.946 | -0.052 | 0.591 |
| 4.907167724907091 | -0.944 | -0.055 | 0.58 |
| 4.91030931756068 | -0.943 | -0.057 | 0.569 |
| 4.91345091021427 | -0.941 | -0.06 | 0.559 |
| 4.91659250286786 | -0.939 | -0.063 | 0.548 |
| 4.91973409552145 | -0.937 | -0.065 | 0.537 |
| 4.922875688175039 | -0.935 | -0.068 | 0.526 |
| 4.926017280828628 | -0.933 | -0.071 | 0.515 |
| 4.929158873482218 | -0.931 | -0.074 | 0.504 |
| 4.932300466135808 | -0.929 | -0.077 | 0.493 |
| 4.935442058789397 | -0.928 | -0.08 | 0.483 |
| 4.938583651442987 | -0.926 | -0.084 | 0.472 |
| 4.941725244096576 | -0.923 | -0.087 | 0.461 |
| 4.944866836750166 | -0.921 | -0.09 | 0.45 |
| 4.948008429403755 | -0.919 | -0.094 | 0.44 |
| 4.951150022057345 | -0.917 | -0.097 | 0.429 |
| 4.954291614710935 | -0.915 | -0.101 | 0.419 |
| 4.957433207364524 | -0.913 | -0.104 | 0.408 |
| 4.960574800018114 | -0.911 | -0.108 | 0.398 |
| 4.963716392671704 | -0.909 | -0.112 | 0.387 |
| 4.966857985325293 | -0.906 | -0.116 | 0.377 |
| 4.969999577978883 | -0.904 | -0.12 | 0.367 |
| 4.973141170632472 | -0.902 | -0.124 | 0.357 |
| 4.976282763286062 | -0.9 | -0.128 | 0.347 |
| 4.979424355939651 | -0.897 | -0.132 | 0.337 |
| 4.982565948593241 | -0.895 | -0.136 | 0.327 |
| 4.985707541246831 | -0.893 | -0.14 | 0.318 |
| 4.98884913390042 | -0.89 | -0.145 | 0.308 |
| 4.99199072655401 | -0.888 | -0.149 | 0.299 |
| 4.9951323192076 | -0.886 | -0.154 | 0.289 |
| 4.99827391186119 | -0.883 | -0.158 | 0.28 |
| 5.00141550451478 | -0.881 | -0.163 | 0.271 |
| 5.004557097168369 | -0.878 | -0.168 | 0.262 |
| 5.007698689821958 | -0.876 | -0.173 | 0.253 |
| 5.010840282475548 | -0.873 | -0.178 | 0.244 |
| 5.013981875129137 | -0.871 | -0.183 | 0.236 |
| 5.017123467782727 | -0.868 | -0.188 | 0.227 |
| 5.020265060436317 | -0.865 | -0.193 | 0.219 |
| 5.023406653089906 | -0.863 | -0.198 | 0.211 |
| 5.026548245743496 | -0.86 | -0.203 | 0.203 |
| 5.029689838397085 | -0.858 | -0.208 | 0.195 |
| 5.032831431050674 | -0.855 | -0.214 | 0.188 |
| 5.035973023704264 | -0.852 | -0.219 | 0.18 |
| 5.039114616357854 | -0.85 | -0.225 | 0.173 |
| 5.042256209011444 | -0.847 | -0.23 | 0.165 |
| 5.045397801665033 | -0.844 | -0.236 | 0.158 |
| 5.048539394318622 | -0.841 | -0.242 | 0.152 |
| 5.051680986972213 | -0.839 | -0.247 | 0.145 |
| 5.054822579625802 | -0.836 | -0.253 | 0.138 |
| 5.057964172279392 | -0.833 | -0.259 | 0.132 |
| 5.061105764932981 | -0.83 | -0.265 | 0.126 |
| 5.064247357586571 | -0.827 | -0.271 | 0.12 |
| 5.067388950240161 | -0.824 | -0.277 | 0.114 |
| 5.07053054289375 | -0.821 | -0.283 | 0.108 |
| 5.07367213554734 | -0.819 | -0.289 | 0.102 |
| 5.07681372820093 | -0.816 | -0.295 | 0.097 |
| 5.079955320854519 | -0.813 | -0.302 | 0.092 |
| 5.083096913508108 | -0.81 | -0.308 | 0.087 |
| 5.086238506161698 | -0.807 | -0.314 | 0.082 |
| 5.089380098815288 | -0.804 | -0.321 | 0.077 |
| 5.092521691468877 | -0.801 | -0.327 | 0.073 |
| 5.095663284122466 | -0.798 | -0.334 | 0.068 |
| 5.098804876776057 | -0.795 | -0.34 | 0.064 |
| 5.101946469429646 | -0.792 | -0.347 | 0.06 |
| 5.105088062083236 | -0.789 | -0.354 | 0.056 |
| 5.108229654736825 | -0.785 | -0.36 | 0.052 |
| 5.111371247390415 | -0.782 | -0.367 | 0.049 |
| 5.114512840044005 | -0.779 | -0.374 | 0.045 |
| 5.117654432697594 | -0.776 | -0.381 | 0.042 |
| 5.120796025351184 | -0.773 | -0.387 | 0.039 |
| 5.123937618004773 | -0.77 | -0.394 | 0.036 |
| 5.127079210658363 | -0.767 | -0.401 | 0.033 |
| 5.130220803311953 | -0.763 | -0.408 | 0.03 |
| 5.133362395965542 | -0.76 | -0.415 | 0.028 |
| 5.136503988619131 | -0.757 | -0.422 | 0.025 |
| 5.13964558127272 | -0.754 | -0.429 | 0.023 |
| 5.142787173926311 | -0.751 | -0.436 | 0.021 |
| 5.1459287665799 | -0.747 | -0.443 | 0.019 |
| 5.14907035923349 | -0.744 | -0.45 | 0.017 |
| 5.15221195188708 | -0.741 | -0.457 | 0.015 |
| 5.15535354454067 | -0.738 | -0.465 | 0.014 |
| 5.158495137194259 | -0.734 | -0.472 | 0.012 |
| 5.161636729847848 | -0.731 | -0.479 | 0.011 |
| 5.164778322501438 | -0.728 | -0.486 | 0.01 |
| 5.167919915155028 | -0.724 | -0.493 | 0.008 |
| 5.171061507808617 | -0.721 | -0.501 | 0.007 |
| 5.174203100462206 | -0.718 | -0.508 | 0.006 |
| 5.177344693115796 | -0.714 | -0.515 | 0.005 |
| 5.180486285769386 | -0.711 | -0.522 | 0.005 |
| 5.183627878422976 | -0.707 | -0.53 | 0.004 |
| 5.186769471076565 | -0.704 | -0.537 | 0.003 |
| 5.189911063730155 | -0.701 | -0.544 | 0.003 |
| 5.193052656383744 | -0.697 | -0.551 | 0.002 |
| 5.196194249037334 | -0.694 | -0.559 | 0.002 |
| 5.199335841690924 | -0.69 | -0.566 | 0.001 |
| 5.202477434344513 | -0.687 | -0.573 | 0.001 |
| 5.205619026998103 | -0.683 | -0.58 | 0.001 |
| 5.208760619651692 | -0.68 | -0.587 | 0.001 |
| 5.211902212305282 | -0.676 | -0.595 | 0 |
| 5.215043804958871 | -0.673 | -0.602 | 0 |
| 5.218185397612461 | -0.669 | -0.609 | 0 |
| 5.221326990266051 | -0.666 | -0.616 | 0 |
| 5.22446858291964 | -0.662 | -0.623 | 0 |
| 5.22761017557323 | -0.659 | -0.631 | 0 |
| 5.23075176822682 | -0.655 | -0.638 | 0 |
| 5.23389336088041 | -0.652 | -0.645 | 0 |
| 5.237034953533999 | -0.648 | -0.652 | 0 |
| 5.240176546187588 | -0.645 | -0.659 | 0 |
| 5.243318138841178 | -0.641 | -0.666 | 0 |
| 5.246459731494767 | -0.638 | -0.673 | 0 |
| 5.249601324148357 | -0.634 | -0.68 | 0 |
| 5.252742916801947 | -0.631 | -0.687 | 0 |
| 5.255884509455536 | -0.627 | -0.694 | 0 |
| 5.259026102109125 | -0.623 | -0.701 | 0 |
| 5.262167694762715 | -0.62 | -0.707 | 0 |
| 5.265309287416305 | -0.616 | -0.714 | -0.001 |
| 5.268450880069895 | -0.613 | -0.721 | -0.001 |
| 5.271592472723484 | -0.609 | -0.728 | -0.001 |
| 5.274734065377074 | -0.606 | -0.734 | -0.002 |
| 5.277875658030664 | -0.602 | -0.741 | -0.002 |
| 5.281017250684253 | -0.598 | -0.747 | -0.002 |
| 5.284158843337843 | -0.595 | -0.754 | -0.003 |
| 5.287300435991432 | -0.591 | -0.76 | -0.004 |
| 5.290442028645022 | -0.587 | -0.767 | -0.004 |
| 5.293583621298612 | -0.584 | -0.773 | -0.005 |
| 5.296725213952201 | -0.58 | -0.779 | -0.006 |
| 5.299866806605791 | -0.577 | -0.785 | -0.007 |
| 5.30300839925938 | -0.573 | -0.792 | -0.008 |
| 5.30614999191297 | -0.569 | -0.798 | -0.009 |
| 5.30929158456656 | -0.566 | -0.804 | -0.01 |
| 5.312433177220149 | -0.562 | -0.81 | -0.012 |
| 5.315574769873739 | -0.559 | -0.816 | -0.013 |
| 5.318716362527328 | -0.555 | -0.821 | -0.015 |
| 5.321857955180918 | -0.551 | -0.827 | -0.017 |
| 5.324999547834508 | -0.548 | -0.833 | -0.018 |
| 5.328141140488097 | -0.544 | -0.839 | -0.02 |
| 5.331282733141686 | -0.54 | -0.844 | -0.022 |
| 5.334424325795276 | -0.537 | -0.85 | -0.025 |
| 5.337565918448866 | -0.533 | -0.855 | -0.027 |
| 5.340707511102456 | -0.53 | -0.86 | -0.03 |
| 5.343849103756045 | -0.526 | -0.865 | -0.032 |
| 5.346990696409634 | -0.522 | -0.871 | -0.035 |
| 5.350132289063224 | -0.519 | -0.876 | -0.038 |
| 5.353273881716814 | -0.515 | -0.881 | -0.041 |
| 5.356415474370403 | -0.511 | -0.886 | -0.044 |
| 5.359557067023993 | -0.508 | -0.89 | -0.048 |
| 5.362698659677583 | -0.504 | -0.895 | -0.051 |
| 5.365840252331172 | -0.501 | -0.9 | -0.055 |
| 5.368981844984762 | -0.497 | -0.904 | -0.059 |
| 5.372123437638351 | -0.493 | -0.909 | -0.063 |
| 5.375265030291941 | -0.49 | -0.913 | -0.067 |
| 5.378406622945531 | -0.486 | -0.917 | -0.071 |
| 5.38154821559912 | -0.483 | -0.921 | -0.076 |
| 5.38468980825271 | -0.479 | -0.926 | -0.08 |
| 5.387831400906299 | -0.475 | -0.929 | -0.085 |
| 5.39097299355989 | -0.472 | -0.933 | -0.09 |
| 5.394114586213479 | -0.468 | -0.937 | -0.095 |
| 5.397256178867068 | -0.465 | -0.941 | -0.101 |
| 5.400397771520657 | -0.461 | -0.944 | -0.106 |
| 5.403539364174247 | -0.457 | -0.948 | -0.112 |
| 5.406680956827837 | -0.454 | -0.951 | -0.118 |
| 5.409822549481426 | -0.45 | -0.954 | -0.124 |
| 5.412964142135016 | -0.447 | -0.958 | -0.13 |
| 5.416105734788605 | -0.443 | -0.961 | -0.136 |
| 5.419247327442195 | -0.44 | -0.964 | -0.143 |
| 5.422388920095785 | -0.436 | -0.966 | -0.149 |
| 5.425530512749375 | -0.433 | -0.969 | -0.156 |
| 5.428672105402964 | -0.429 | -0.972 | -0.163 |
| 5.431813698056554 | -0.426 | -0.974 | -0.17 |
| 5.434955290710143 | -0.422 | -0.977 | -0.178 |
| 5.438096883363733 | -0.419 | -0.979 | -0.185 |
| 5.441238476017322 | -0.415 | -0.981 | -0.193 |
| 5.444380068670912 | -0.412 | -0.983 | -0.2 |
| 5.447521661324502 | -0.408 | -0.985 | -0.208 |
| 5.450663253978091 | -0.405 | -0.987 | -0.216 |
| 5.453804846631681 | -0.401 | -0.988 | -0.225 |
| 5.456946439285271 | -0.398 | -0.99 | -0.233 |
| 5.46008803193886 | -0.394 | -0.992 | -0.242 |
| 5.46322962459245 | -0.391 | -0.993 | -0.25 |
| 5.466371217246039 | -0.387 | -0.994 | -0.259 |
| 5.46951280989963 | -0.384 | -0.995 | -0.268 |
| 5.472654402553218 | -0.381 | -0.996 | -0.277 |
| 5.475795995206808 | -0.377 | -0.997 | -0.286 |
| 5.478937587860398 | -0.374 | -0.998 | -0.295 |
| 5.482079180513987 | -0.37 | -0.999 | -0.305 |
| 5.485220773167577 | -0.367 | -0.999 | -0.314 |
| 5.488362365821166 | -0.364 | -0.999 | -0.324 |
| 5.491503958474756 | -0.36 | -1 | -0.334 |
| 5.494645551128346 | -0.357 | -1 | -0.344 |
| 5.497787143781935 | -0.354 | -1 | -0.354 |
| 5.500928736435525 | -0.35 | -1 | -0.364 |
| 5.504070329089115 | -0.347 | -1 | -0.374 |
| 5.507211921742704 | -0.344 | -0.999 | -0.384 |
| 5.510353514396294 | -0.34 | -0.999 | -0.394 |
| 5.513495107049883 | -0.337 | -0.999 | -0.405 |
| 5.516636699703473 | -0.334 | -0.998 | -0.415 |
| 5.519778292357062 | -0.33 | -0.997 | -0.426 |
| 5.522919885010652 | -0.327 | -0.996 | -0.436 |
| 5.526061477664242 | -0.324 | -0.995 | -0.447 |
| 5.529203070317831 | -0.321 | -0.994 | -0.457 |
| 5.532344662971421 | -0.318 | -0.993 | -0.468 |
| 5.535486255625011 | -0.314 | -0.992 | -0.479 |
| 5.5386278482786 | -0.311 | -0.99 | -0.49 |
| 5.54176944093219 | -0.308 | -0.988 | -0.501 |
| 5.544911033585779 | -0.305 | -0.987 | -0.511 |
| 5.54805262623937 | -0.302 | -0.985 | -0.522 |
| 5.551194218892959 | -0.299 | -0.983 | -0.533 |
| 5.554335811546548 | -0.295 | -0.981 | -0.544 |
| 5.557477404200137 | -0.292 | -0.979 | -0.555 |
| 5.560618996853727 | -0.289 | -0.977 | -0.566 |
| 5.563760589507317 | -0.286 | -0.974 | -0.577 |
| 5.566902182160906 | -0.283 | -0.972 | -0.587 |
| 5.570043774814496 | -0.28 | -0.969 | -0.598 |
| 5.573185367468086 | -0.277 | -0.966 | -0.609 |
| 5.576326960121675 | -0.274 | -0.964 | -0.62 |
| 5.579468552775264 | -0.271 | -0.961 | -0.631 |
| 5.582610145428854 | -0.268 | -0.958 | -0.641 |
| 5.585751738082444 | -0.265 | -0.954 | -0.652 |
| 5.588893330736034 | -0.262 | -0.951 | -0.662 |
| 5.592034923389623 | -0.259 | -0.948 | -0.673 |
| 5.595176516043213 | -0.256 | -0.944 | -0.683 |
| 5.598318108696803 | -0.253 | -0.941 | -0.694 |
| 5.601459701350392 | -0.25 | -0.937 | -0.704 |
| 5.604601294003982 | -0.247 | -0.933 | -0.714 |
| 5.607742886657571 | -0.244 | -0.929 | -0.724 |
| 5.610884479311161 | -0.242 | -0.926 | -0.734 |
| 5.61402607196475 | -0.239 | -0.921 | -0.744 |
| 5.61716766461834 | -0.236 | -0.917 | -0.754 |
| 5.62030925727193 | -0.233 | -0.913 | -0.763 |
| 5.623450849925519 | -0.23 | -0.909 | -0.773 |
| 5.626592442579109 | -0.227 | -0.904 | -0.782 |
| 5.629734035232698 | -0.225 | -0.9 | -0.792 |
| 5.632875627886288 | -0.222 | -0.895 | -0.801 |
| 5.636017220539878 | -0.219 | -0.89 | -0.81 |
| 5.639158813193467 | -0.216 | -0.886 | -0.819 |
| 5.642300405847057 | -0.214 | -0.881 | -0.827 |
| 5.645441998500646 | -0.211 | -0.876 | -0.836 |
| 5.648583591154236 | -0.208 | -0.871 | -0.844 |
| 5.651725183807825 | -0.206 | -0.865 | -0.852 |
| 5.654866776461415 | -0.203 | -0.86 | -0.86 |
| 5.658008369115005 | -0.2 | -0.855 | -0.868 |
| 5.661149961768594 | -0.198 | -0.85 | -0.876 |
| 5.664291554422184 | -0.195 | -0.844 | -0.883 |
| 5.667433147075774 | -0.193 | -0.839 | -0.89 |
| 5.670574739729363 | -0.19 | -0.833 | -0.897 |
| 5.673716332382953 | -0.188 | -0.827 | -0.904 |
| 5.676857925036542 | -0.185 | -0.821 | -0.911 |
| 5.679999517690132 | -0.183 | -0.816 | -0.917 |
| 5.683141110343721 | -0.18 | -0.81 | -0.923 |
| 5.686282702997311 | -0.178 | -0.804 | -0.929 |
| 5.689424295650901 | -0.175 | -0.798 | -0.935 |
| 5.69256588830449 | -0.173 | -0.792 | -0.941 |
| 5.69570748095808 | -0.17 | -0.785 | -0.946 |
| 5.69884907361167 | -0.168 | -0.779 | -0.951 |
| 5.701990666265259 | -0.165 | -0.773 | -0.956 |
| 5.705132258918849 | -0.163 | -0.767 | -0.961 |
| 5.708273851572438 | -0.161 | -0.76 | -0.965 |
| 5.711415444226028 | -0.158 | -0.754 | -0.969 |
| 5.714557036879618 | -0.156 | -0.747 | -0.973 |
| 5.717698629533207 | -0.154 | -0.741 | -0.977 |
| 5.720840222186797 | -0.152 | -0.734 | -0.98 |
| 5.723981814840386 | -0.149 | -0.728 | -0.983 |
| 5.727123407493976 | -0.147 | -0.721 | -0.986 |
| 5.730265000147565 | -0.145 | -0.714 | -0.988 |
| 5.733406592801155 | -0.143 | -0.707 | -0.991 |
| 5.736548185454744 | -0.14 | -0.701 | -0.993 |
| 5.739689778108334 | -0.138 | -0.694 | -0.995 |
| 5.742831370761924 | -0.136 | -0.687 | -0.996 |
| 5.745972963415514 | -0.134 | -0.68 | -0.998 |
| 5.749114556069103 | -0.132 | -0.673 | -0.999 |
| 5.752256148722693 | -0.13 | -0.666 | -0.999 |
| 5.755397741376282 | -0.128 | -0.659 | -1 |
| 5.758539334029872 | -0.126 | -0.652 | -1 |
| 5.761680926683462 | -0.124 | -0.645 | -1 |
| 5.764822519337051 | -0.122 | -0.638 | -1 |
| 5.767964111990641 | -0.12 | -0.631 | -0.999 |
| 5.77110570464423 | -0.118 | -0.623 | -0.998 |
| 5.77424729729782 | -0.116 | -0.616 | -0.997 |
| 5.77738888995141 | -0.114 | -0.609 | -0.996 |
| 5.780530482605 | -0.112 | -0.602 | -0.994 |
| 5.783672075258588 | -0.11 | -0.595 | -0.992 |
| 5.786813667912178 | -0.108 | -0.587 | -0.99 |
| 5.789955260565768 | -0.106 | -0.58 | -0.988 |
| 5.793096853219358 | -0.104 | -0.573 | -0.985 |
| 5.796238445872947 | -0.102 | -0.566 | -0.982 |
| 5.799380038526537 | -0.101 | -0.559 | -0.979 |
| 5.802521631180126 | -0.099 | -0.551 | -0.975 |
| 5.805663223833715 | -0.097 | -0.544 | -0.972 |
| 5.808804816487306 | -0.095 | -0.537 | -0.968 |
| 5.811946409140895 | -0.094 | -0.53 | -0.964 |
| 5.815088001794485 | -0.092 | -0.522 | -0.959 |
| 5.818229594448074 | -0.09 | -0.515 | -0.954 |
| 5.821371187101663 | -0.088 | -0.508 | -0.949 |
| 5.824512779755254 | -0.087 | -0.501 | -0.944 |
| 5.827654372408843 | -0.085 | -0.493 | -0.939 |
| 5.830795965062433 | -0.084 | -0.486 | -0.933 |
| 5.833937557716022 | -0.082 | -0.479 | -0.928 |
| 5.837079150369612 | -0.08 | -0.472 | -0.921 |
| 5.840220743023201 | -0.079 | -0.465 | -0.915 |
| 5.843362335676791 | -0.077 | -0.457 | -0.909 |
| 5.846503928330381 | -0.076 | -0.45 | -0.902 |
| 5.84964552098397 | -0.074 | -0.443 | -0.895 |
| 5.85278711363756 | -0.073 | -0.436 | -0.888 |
| 5.85592870629115 | -0.071 | -0.429 | -0.881 |
| 5.85907029894474 | -0.07 | -0.422 | -0.873 |
| 5.862211891598329 | -0.068 | -0.415 | -0.865 |
| 5.865353484251918 | -0.067 | -0.408 | -0.858 |
| 5.868495076905508 | -0.065 | -0.401 | -0.85 |
| 5.871636669559098 | -0.064 | -0.394 | -0.841 |
| 5.874778262212687 | -0.063 | -0.387 | -0.833 |
| 5.877919854866277 | -0.061 | -0.381 | -0.824 |
| 5.881061447519866 | -0.06 | -0.374 | -0.816 |
| 5.884203040173456 | -0.059 | -0.367 | -0.807 |
| 5.887344632827046 | -0.057 | -0.36 | -0.798 |
| 5.890486225480635 | -0.056 | -0.354 | -0.789 |
| 5.893627818134224 | -0.055 | -0.347 | -0.779 |
| 5.896769410787814 | -0.054 | -0.34 | -0.77 |
| 5.899911003441404 | -0.052 | -0.334 | -0.76 |
| 5.903052596094994 | -0.051 | -0.327 | -0.751 |
| 5.906194188748583 | -0.05 | -0.321 | -0.741 |
| 5.909335781402172 | -0.049 | -0.314 | -0.731 |
| 5.912477374055762 | -0.048 | -0.308 | -0.721 |
| 5.915618966709352 | -0.046 | -0.302 | -0.711 |
| 5.918760559362942 | -0.045 | -0.295 | -0.701 |
| 5.921902152016531 | -0.044 | -0.289 | -0.69 |
| 5.92504374467012 | -0.043 | -0.283 | -0.68 |
| 5.92818533732371 | -0.042 | -0.277 | -0.669 |
| 5.9313269299773 | -0.041 | -0.271 | -0.659 |
| 5.93446852263089 | -0.04 | -0.265 | -0.648 |
| 5.93761011528448 | -0.039 | -0.259 | -0.638 |
| 5.940751707938068 | -0.038 | -0.253 | -0.627 |
| 5.943893300591658 | -0.037 | -0.247 | -0.616 |
| 5.947034893245248 | -0.036 | -0.242 | -0.606 |
| 5.950176485898837 | -0.035 | -0.236 | -0.595 |
| 5.953318078552427 | -0.034 | -0.23 | -0.584 |
| 5.956459671206017 | -0.033 | -0.225 | -0.573 |
| 5.959601263859606 | -0.032 | -0.219 | -0.562 |
| 5.962742856513196 | -0.031 | -0.214 | -0.551 |
| 5.965884449166785 | -0.03 | -0.208 | -0.54 |
| 5.969026041820375 | -0.03 | -0.203 | -0.53 |
| 5.972167634473964 | -0.029 | -0.198 | -0.519 |
| 5.975309227127554 | -0.028 | -0.193 | -0.508 |
| 5.978450819781144 | -0.027 | -0.188 | -0.497 |
| 5.981592412434733 | -0.026 | -0.183 | -0.486 |
| 5.984734005088323 | -0.025 | -0.178 | -0.475 |
| 5.987875597741913 | -0.025 | -0.173 | -0.465 |
| 5.991017190395502 | -0.024 | -0.168 | -0.454 |
| 5.994158783049092 | -0.023 | -0.163 | -0.443 |
| 5.997300375702681 | -0.022 | -0.158 | -0.433 |
| 6.000441968356271 | -0.022 | -0.154 | -0.422 |
| 6.003583561009861 | -0.021 | -0.149 | -0.412 |
| 6.00672515366345 | -0.02 | -0.145 | -0.401 |
| 6.00986674631704 | -0.02 | -0.14 | -0.391 |
| 6.01300833897063 | -0.019 | -0.136 | -0.381 |
| 6.01614993162422 | -0.018 | -0.132 | -0.37 |
| 6.019291524277808 | -0.018 | -0.128 | -0.36 |
| 6.022433116931398 | -0.017 | -0.124 | -0.35 |
| 6.025574709584988 | -0.017 | -0.12 | -0.34 |
| 6.028716302238577 | -0.016 | -0.116 | -0.33 |
| 6.031857894892167 | -0.015 | -0.112 | -0.321 |
| 6.034999487545757 | -0.015 | -0.108 | -0.311 |
| 6.038141080199346 | -0.014 | -0.104 | -0.302 |
| 6.041282672852935 | -0.014 | -0.101 | -0.292 |
| 6.044424265506525 | -0.013 | -0.097 | -0.283 |
| 6.047565858160115 | -0.013 | -0.094 | -0.274 |
| 6.050707450813704 | -0.012 | -0.09 | -0.265 |
| 6.053849043467294 | -0.012 | -0.087 | -0.256 |
| 6.056990636120884 | -0.011 | -0.084 | -0.247 |
| 6.060132228774473 | -0.011 | -0.08 | -0.239 |
| 6.063273821428063 | -0.01 | -0.077 | -0.23 |
| 6.066415414081653 | -0.01 | -0.074 | -0.222 |
| 6.069557006735242 | -0.01 | -0.071 | -0.214 |
| 6.072698599388831 | -0.009 | -0.068 | -0.206 |
| 6.07584019204242 | -0.009 | -0.065 | -0.198 |
| 6.078981784696011 | -0.008 | -0.063 | -0.19 |
| 6.082123377349601 | -0.008 | -0.06 | -0.183 |
| 6.08526497000319 | -0.008 | -0.057 | -0.175 |
| 6.08840656265678 | -0.007 | -0.055 | -0.168 |
| 6.09154815531037 | -0.007 | -0.052 | -0.161 |
| 6.094689747963959 | -0.007 | -0.05 | -0.154 |
| 6.097831340617549 | -0.006 | -0.048 | -0.147 |
| 6.100972933271138 | -0.006 | -0.045 | -0.14 |
| 6.104114525924728 | -0.006 | -0.043 | -0.134 |
| 6.107256118578317 | -0.005 | -0.041 | -0.128 |
| 6.110397711231907 | -0.005 | -0.039 | -0.122 |
| 6.113539303885497 | -0.005 | -0.037 | -0.116 |
| 6.116680896539086 | -0.005 | -0.035 | -0.11 |
| 6.119822489192675 | -0.004 | -0.033 | -0.104 |
| 6.122964081846265 | -0.004 | -0.031 | -0.099 |
| 6.126105674499855 | -0.004 | -0.03 | -0.094 |
| 6.129247267153445 | -0.004 | -0.028 | -0.088 |
| 6.132388859807034 | -0.003 | -0.026 | -0.084 |
| 6.135530452460624 | -0.003 | -0.025 | -0.079 |
| 6.138672045114213 | -0.003 | -0.023 | -0.074 |
| 6.141813637767803 | -0.003 | -0.022 | -0.07 |
| 6.144955230421393 | -0.003 | -0.02 | -0.065 |
| 6.148096823074982 | -0.002 | -0.019 | -0.061 |
| 6.151238415728571 | -0.002 | -0.018 | -0.057 |
| 6.154380008382161 | -0.002 | -0.017 | -0.054 |
| 6.157521601035751 | -0.002 | -0.015 | -0.05 |
| 6.16066319368934 | -0.002 | -0.014 | -0.046 |
| 6.16380478634293 | -0.002 | -0.013 | -0.043 |
| 6.16694637899652 | -0.002 | -0.012 | -0.04 |
| 6.170087971650109 | -0.001 | -0.011 | -0.037 |
| 6.173229564303698 | -0.001 | -0.01 | -0.034 |
| 6.176371156957289 | -0.001 | -0.01 | -0.031 |
| 6.179512749610878 | -0.001 | -0.009 | -0.029 |
| 6.182654342264468 | -0.001 | -0.008 | -0.026 |
| 6.185795934918057 | -0.001 | -0.007 | -0.024 |
| 6.188937527571647 | -0.001 | -0.007 | -0.022 |
| 6.192079120225237 | -0.001 | -0.006 | -0.02 |
| 6.195220712878826 | -0.001 | -0.005 | -0.018 |
| 6.198362305532415 | -0.001 | -0.005 | -0.016 |
| 6.201503898186005 | -0.001 | -0.004 | -0.014 |
| 6.204645490839594 | 0 | -0.004 | -0.013 |
| 6.207787083493184 | 0 | -0.003 | -0.011 |
| 6.210928676146774 | 0 | -0.003 | -0.01 |
| 6.214070268800364 | 0 | -0.003 | -0.009 |
| 6.217211861453953 | 0 | -0.002 | -0.008 |
| 6.220353454107543 | 0 | -0.002 | -0.007 |
| 6.223495046761133 | 0 | -0.002 | -0.006 |
| 6.226636639414722 | 0 | -0.001 | -0.005 |
| 6.229778232068312 | 0 | -0.001 | -0.004 |
| 6.232919824721901 | 0 | -0.001 | -0.003 |
| 6.236061417375491 | 0 | -0.001 | -0.003 |
| 6.23920301002908 | 0 | -0.001 | -0.002 |
| 6.24234460268267 | 0 | -0.001 | -0.002 |
| 6.24548619533626 | 0 | 0 | -0.001 |
| 6.24862778798985 | 0 | 0 | -0.001 |
| 6.251769380643438 | 0 | 0 | -0.001 |
| 6.254910973297028 | 0 | 0 | -0.001 |
| 6.258052565950618 | 0 | 0 | 0 |
| 6.261194158604208 | 0 | 0 | 0 |
| 6.264335751257797 | 0 | 0 | 0 |
| 6.267477343911387 | 0 | 0 | 0 |
| 6.270618936564976 | 0 | 0 | 0 |
| 6.273760529218566 | 0 | 0 | 0 |
| 6.276902121872155 | 0 | 0 | 0 |
| 6.280043714525745 | 0 | 0 | 0 |
| 6.283185307179335 | 0 | 0 | 0 |